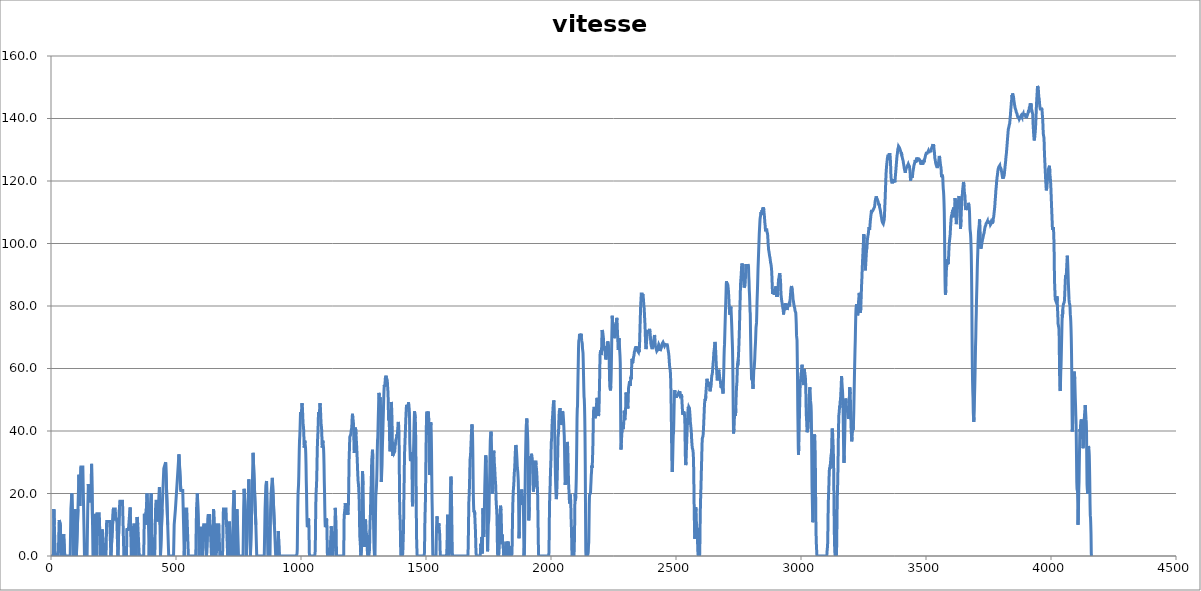
| Category | vitesse (km/h) |
|---|---|
| 0.0 | 0 |
| 9.4 | 0 |
| 11.4 | 15.012 |
| 13.3 | 10.008 |
| 17.1 | 0 |
| 29.2 | 0 |
| 32.7 | 11.484 |
| 34.1 | 11.484 |
| 37.6 | 10.008 |
| 40.8 | 0 |
| 48.9 | 0 |
| 50.6 | 6.984 |
| 51.3 | 6.984 |
| 55.0 | 0 |
| 76.9 | 0 |
| 79.6 | 15.012 |
| 79.8 | 15.012 |
| 80.0 | 15.012 |
| 80.9 | 15.012 |
| 83.3 | 20.016 |
| 87.1 | 10.008 |
| 90.5 | 0 |
| 90.9 | 0 |
| 95.5 | 15.012 |
| 98.2 | 15.012 |
| 99.3 | 10.008 |
| 101.5 | 0 |
| 105.1 | 0 |
| 107.9 | 15.012 |
| 108.4 | 15.012 |
| 108.9 | 15.012 |
| 111.6 | 25.992 |
| 112.4 | 25.992 |
| 115.2 | 15.984 |
| 119.8 | 28.512 |
| 127.4 | 28.512 |
| 131.7 | 10.008 |
| 133.9 | 0 |
| 144.4 | 0 |
| 146.8 | 14.508 |
| 147.2 | 14.508 |
| 147.7 | 14.508 |
| 149.4 | 23.004 |
| 149.9 | 23.004 |
| 151.5 | 17.496 |
| 159.3 | 17.496 |
| 162.3 | 29.484 |
| 163.3 | 29.484 |
| 166.3 | 10.008 |
| 167.9 | 0 |
| 175.5 | 0 |
| 178.3 | 13.5 |
| 180.9 | 13.5 |
| 181.3 | 10.008 |
| 182.6 | 0 |
| 184.3 | 13.5 |
| 193.1 | 13.5 |
| 194.3 | 10.008 |
| 197.7 | 0 |
| 202.4 | 0 |
| 204.3 | 8.496 |
| 206.5 | 7.488 |
| 211.1 | 0 |
| 220.1 | 0 |
| 222.6 | 11.016 |
| 234.7 | 11.016 |
| 239.7 | 0 |
| 242.2 | 0 |
| 249.5 | 15.012 |
| 256.9 | 15.012 |
| 259.0 | 11.736 |
| 263.3 | 11.736 |
| 263.7 | 10.008 |
| 267.7 | 0 |
| 270.5 | 0 |
| 273.6 | 15.012 |
| 274.1 | 15.012 |
| 274.6 | 15.012 |
| 275.4 | 17.496 |
| 286.0 | 17.496 |
| 288.4 | 10.008 |
| 291.5 | 0 |
| 302.0 | 0 |
| 303.5 | 8.496 |
| 309.7 | 8.496 |
| 316.5 | 15.516 |
| 318.4 | 10.008 |
| 321.3 | 0 |
| 328.4 | 0 |
| 331.4 | 10.008 |
| 335.9 | 10.008 |
| 340.3 | 0 |
| 341.3 | 0 |
| 344.6 | 12.492 |
| 345.6 | 12.492 |
| 347.1 | 10.008 |
| 353.1 | 0 |
| 370.8 | 0 |
| 373.5 | 13.5 |
| 374.5 | 13.5 |
| 376.8 | 10.008 |
| 379.9 | 10.008 |
| 381.4 | 15.012 |
| 381.9 | 15.012 |
| 382.4 | 15.012 |
| 383.9 | 20.016 |
| 387.2 | 20.016 |
| 390.0 | 10.008 |
| 392.7 | 0 |
| 393.3 | 0 |
| 396.7 | 15.012 |
| 397.2 | 15.012 |
| 397.7 | 15.012 |
| 400.8 | 20.016 |
| 402.6 | 10.008 |
| 404.9 | 0 |
| 415.1 | 0 |
| 418.2 | 15.012 |
| 418.7 | 15.012 |
| 419.2 | 15.012 |
| 420.0 | 17.496 |
| 425.5 | 17.496 |
| 429.0 | 11.016 |
| 433.8 | 21.996 |
| 436.1 | 10.008 |
| 437.9 | 0 |
| 441.0 | 0 |
| 444.6 | 15.012 |
| 445.1 | 15.012 |
| 445.6 | 15.012 |
| 451.2 | 28.008 |
| 458.6 | 29.988 |
| 466.8 | 10.008 |
| 470.8 | 0 |
| 490.2 | 0 |
| 492.7 | 10.008 |
| 496.1 | 10.008 |
| 497.7 | 15.012 |
| 498.2 | 15.012 |
| 498.7 | 15.012 |
| 511.7 | 32.508 |
| 512.7 | 32.508 |
| 519.2 | 20.988 |
| 527.0 | 20.988 |
| 530.3 | 10.008 |
| 533.0 | 0 |
| 534.4 | 0 |
| 537.8 | 15.012 |
| 543.0 | 15.012 |
| 545.2 | 10.008 |
| 549.5 | 0 |
| 579.1 | 0 |
| 582.1 | 15.012 |
| 582.6 | 15.012 |
| 583.1 | 15.012 |
| 585.4 | 20.016 |
| 586.6 | 20.016 |
| 589.6 | 10.008 |
| 592.4 | 0 |
| 595.1 | 0 |
| 596.7 | 9 |
| 603.5 | 9 |
| 606.4 | 0 |
| 609.1 | 0 |
| 611.0 | 10.008 |
| 618.7 | 10.008 |
| 622.1 | 0 |
| 625.7 | 0 |
| 628.9 | 12.996 |
| 634.7 | 12.996 |
| 636.4 | 10.008 |
| 642.0 | 0 |
| 647.8 | 0 |
| 650.3 | 15.012 |
| 651.5 | 15.012 |
| 652.8 | 10.008 |
| 655.5 | 0 |
| 661.3 | 0 |
| 663.5 | 10.008 |
| 671.5 | 10.008 |
| 675.1 | 0 |
| 686.2 | 0 |
| 689.7 | 15.012 |
| 700.0 | 15.012 |
| 702.2 | 10.008 |
| 706.6 | 0 |
| 712.1 | 0 |
| 713.5 | 11.016 |
| 714.5 | 11.016 |
| 718.4 | 0 |
| 726.5 | 0 |
| 728.7 | 15.012 |
| 729.1 | 15.012 |
| 729.6 | 15.012 |
| 732.0 | 20.988 |
| 732.8 | 20.988 |
| 735.8 | 10.008 |
| 738.5 | 0 |
| 740.7 | 0 |
| 743.3 | 15.012 |
| 744.3 | 15.012 |
| 746.2 | 10.008 |
| 750.0 | 0 |
| 768.3 | 0 |
| 770.6 | 15.012 |
| 771.1 | 15.012 |
| 771.6 | 15.012 |
| 772.5 | 21.492 |
| 776.2 | 21.492 |
| 779.1 | 10.008 |
| 781.4 | 0 |
| 784.7 | 0 |
| 787.2 | 15.012 |
| 788.2 | 15.012 |
| 791.3 | 24.516 |
| 793.3 | 24.516 |
| 795.7 | 10.008 |
| 797.7 | 0 |
| 798.9 | 0 |
| 802.8 | 15.012 |
| 803.3 | 15.012 |
| 803.8 | 15.012 |
| 808.4 | 33.012 |
| 812.3 | 33.012 |
| 819.4 | 10.008 |
| 822.9 | 0 |
| 853.1 | 0 |
| 856.3 | 15.012 |
| 856.8 | 15.012 |
| 857.3 | 15.012 |
| 859.4 | 22.5 |
| 862.2 | 24.012 |
| 865.2 | 10.008 |
| 867.5 | 0 |
| 876.0 | 0 |
| 878.3 | 15.012 |
| 878.8 | 15.012 |
| 879.3 | 15.012 |
| 880.3 | 20.016 |
| 885.3 | 24.984 |
| 893.5 | 10.008 |
| 898.8 | 0 |
| 907.4 | 0 |
| 909.3 | 7.992 |
| 910.0 | 7.992 |
| 913.1 | 0 |
| 933.1 | 0 |
| 964.1 | 0 |
| 965.1 | 0 |
| 966.1 | 0 |
| 967.1 | 0 |
| 968.1 | 0 |
| 969.1 | 0 |
| 970.1 | 0 |
| 971.1 | 0 |
| 972.1 | 0 |
| 973.1 | 0 |
| 974.1 | 0 |
| 975.1 | 0 |
| 976.1 | 0 |
| 977.1 | 0 |
| 978.1 | 0 |
| 979.1 | 0 |
| 980.1 | 0 |
| 981.1 | 0 |
| 982.1 | 0 |
| 983.1 | 0 |
| 984.1 | 0.7 |
| 985.1 | 2.1 |
| 986.1 | 9.2 |
| 987.1 | 15.6 |
| 988.1 | 19.8 |
| 989.1 | 19.8 |
| 990.1 | 22.7 |
| 991.1 | 25.5 |
| 992.1 | 29.8 |
| 993.1 | 34 |
| 994.1 | 36.9 |
| 995.1 | 38.3 |
| 996.1 | 40.4 |
| 997.1 | 43.2 |
| 998.1 | 46.1 |
| 999.1 | 46.1 |
| 1000.1 | 46.1 |
| 1001.1 | 44.6 |
| 1002.1 | 46.1 |
| 1003.1 | 48.2 |
| 1004.1 | 48.9 |
| 1005.1 | 48.2 |
| 1006.1 | 46.8 |
| 1007.1 | 44.6 |
| 1008.1 | 42.5 |
| 1009.1 | 41.8 |
| 1010.1 | 41.1 |
| 1011.1 | 39.7 |
| 1012.1 | 36.1 |
| 1013.1 | 34.7 |
| 1014.1 | 34.7 |
| 1015.1 | 36.9 |
| 1016.1 | 36.1 |
| 1017.1 | 36.1 |
| 1018.1 | 34.7 |
| 1019.1 | 32.6 |
| 1020.1 | 29.1 |
| 1021.1 | 24.1 |
| 1022.1 | 20.6 |
| 1023.1 | 15.6 |
| 1024.1 | 11.3 |
| 1025.1 | 9.2 |
| 1026.1 | 9.2 |
| 1027.1 | 9.2 |
| 1028.1 | 9.9 |
| 1029.1 | 10.6 |
| 1030.1 | 12 |
| 1031.1 | 11.3 |
| 1032.1 | 7.8 |
| 1033.1 | 1.4 |
| 1034.1 | 0 |
| 1035.1 | 0 |
| 1036.1 | 0 |
| 1037.1 | 0 |
| 1038.1 | 0 |
| 1039.1 | 0 |
| 1040.1 | 0 |
| 1041.1 | 0 |
| 1042.1 | 0 |
| 1043.1 | 0 |
| 1044.1 | 0 |
| 1045.1 | 0 |
| 1046.1 | 0 |
| 1047.1 | 0 |
| 1048.1 | 0 |
| 1049.1 | 0 |
| 1050.1 | 0 |
| 1051.1 | 0 |
| 1052.1 | 0 |
| 1053.1 | 0 |
| 1054.1 | 0 |
| 1055.1 | 0 |
| 1056.1 | 0.7 |
| 1057.1 | 2.1 |
| 1058.1 | 9.2 |
| 1059.1 | 15.6 |
| 1060.1 | 19.8 |
| 1061.1 | 19.8 |
| 1062.1 | 22.7 |
| 1063.1 | 25.5 |
| 1064.1 | 29.8 |
| 1065.1 | 34 |
| 1066.1 | 36.9 |
| 1067.1 | 38.3 |
| 1068.1 | 40.4 |
| 1069.1 | 43.2 |
| 1070.1 | 46.1 |
| 1071.1 | 46.1 |
| 1072.1 | 46.1 |
| 1073.1 | 44.6 |
| 1074.1 | 46.1 |
| 1075.1 | 48.2 |
| 1076.1 | 48.9 |
| 1077.1 | 48.2 |
| 1078.1 | 46.8 |
| 1079.1 | 44.6 |
| 1080.1 | 42.5 |
| 1081.1 | 41.8 |
| 1082.1 | 41.1 |
| 1083.1 | 39.7 |
| 1084.1 | 36.1 |
| 1085.1 | 34.7 |
| 1086.1 | 34.7 |
| 1087.1 | 36.9 |
| 1088.1 | 36.1 |
| 1089.1 | 36.1 |
| 1090.1 | 34.7 |
| 1091.1 | 32.6 |
| 1092.1 | 29.1 |
| 1093.1 | 24.1 |
| 1094.1 | 20.6 |
| 1095.1 | 15.6 |
| 1096.1 | 11.3 |
| 1097.1 | 9.2 |
| 1098.1 | 9.2 |
| 1099.1 | 9.2 |
| 1100.1 | 9.9 |
| 1101.1 | 10.6 |
| 1102.1 | 12 |
| 1103.1 | 11.3 |
| 1104.1 | 7.8 |
| 1105.1 | 1.4 |
| 1106.1 | 0 |
| 1107.1 | 0 |
| 1108.1 | 0 |
| 1109.1 | 0 |
| 1110.1 | 0 |
| 1111.1 | 0 |
| 1112.1 | 0 |
| 1113.1 | 0 |
| 1114.1 | 0 |
| 1115.1 | 0 |
| 1116.1 | 0.7 |
| 1117.1 | 1.5 |
| 1118.1 | 4.4 |
| 1119.1 | 5.9 |
| 1120.1 | 7.3 |
| 1121.1 | 9.5 |
| 1122.1 | 8.1 |
| 1123.1 | 3.7 |
| 1124.1 | 2.9 |
| 1125.1 | 4.4 |
| 1126.1 | 0.7 |
| 1127.1 | 0 |
| 1128.1 | 0 |
| 1129.1 | 2.2 |
| 1130.1 | 2.2 |
| 1131.1 | 2.9 |
| 1132.1 | 7.3 |
| 1133.1 | 5.9 |
| 1134.1 | 7.3 |
| 1135.1 | 8.8 |
| 1136.1 | 11 |
| 1137.1 | 15.4 |
| 1138.1 | 13.9 |
| 1139.1 | 11.7 |
| 1140.1 | 11 |
| 1141.1 | 5.1 |
| 1142.1 | 0 |
| 1143.1 | 0 |
| 1144.1 | 0 |
| 1145.1 | 0 |
| 1146.1 | 0 |
| 1147.1 | 0 |
| 1148.1 | 0 |
| 1149.1 | 0 |
| 1150.1 | 0 |
| 1151.1 | 0 |
| 1152.1 | 0 |
| 1153.1 | 0 |
| 1154.1 | 0 |
| 1155.1 | 0 |
| 1156.1 | 0 |
| 1157.1 | 0 |
| 1158.1 | 0 |
| 1159.1 | 0 |
| 1160.1 | 0 |
| 1161.1 | 0 |
| 1162.1 | 0 |
| 1163.1 | 0 |
| 1164.1 | 0 |
| 1165.1 | 0 |
| 1166.1 | 0 |
| 1167.1 | 0 |
| 1168.1 | 0 |
| 1169.1 | 0 |
| 1170.1 | 0 |
| 1171.1 | 0.7 |
| 1172.1 | 11 |
| 1173.1 | 13.2 |
| 1174.1 | 13.9 |
| 1175.1 | 14.7 |
| 1176.1 | 15.4 |
| 1177.1 | 16.9 |
| 1178.1 | 16.1 |
| 1179.1 | 15.4 |
| 1180.1 | 13.9 |
| 1181.1 | 13.2 |
| 1182.1 | 13.2 |
| 1183.1 | 15.4 |
| 1184.1 | 16.9 |
| 1185.1 | 16.1 |
| 1186.1 | 14.7 |
| 1187.1 | 13.2 |
| 1188.1 | 13.9 |
| 1189.1 | 14.7 |
| 1190.1 | 18.3 |
| 1191.1 | 22 |
| 1192.1 | 30.1 |
| 1193.1 | 32.3 |
| 1194.1 | 32.3 |
| 1195.1 | 38.1 |
| 1196.1 | 38.1 |
| 1197.1 | 38.1 |
| 1198.1 | 38.1 |
| 1199.1 | 38.9 |
| 1200.1 | 39.6 |
| 1201.1 | 40.3 |
| 1202.1 | 40.3 |
| 1203.1 | 41.1 |
| 1204.1 | 43.3 |
| 1205.1 | 44.7 |
| 1206.1 | 45.5 |
| 1207.1 | 44 |
| 1208.1 | 44 |
| 1209.1 | 43.3 |
| 1210.1 | 41.8 |
| 1211.1 | 38.9 |
| 1212.1 | 34.5 |
| 1213.1 | 33 |
| 1214.1 | 33.7 |
| 1215.1 | 36.7 |
| 1216.1 | 37.4 |
| 1217.1 | 40.3 |
| 1218.1 | 41.1 |
| 1219.1 | 41.1 |
| 1220.1 | 38.9 |
| 1221.1 | 37.4 |
| 1222.1 | 35.9 |
| 1223.1 | 34.5 |
| 1224.1 | 32.3 |
| 1225.1 | 30.8 |
| 1226.1 | 27.9 |
| 1227.1 | 26.4 |
| 1228.1 | 24.2 |
| 1229.1 | 23.5 |
| 1230.1 | 22.7 |
| 1231.1 | 21.3 |
| 1232.1 | 19.1 |
| 1233.1 | 16.9 |
| 1234.1 | 11 |
| 1235.1 | 6.6 |
| 1236.1 | 5.1 |
| 1237.1 | 4.4 |
| 1238.1 | 2.2 |
| 1239.1 | 0 |
| 1240.1 | 0 |
| 1241.1 | 0 |
| 1242.1 | 2.2 |
| 1243.1 | 5.1 |
| 1244.1 | 13.9 |
| 1245.1 | 22.7 |
| 1246.1 | 27.1 |
| 1247.1 | 27.1 |
| 1248.1 | 22.7 |
| 1249.1 | 18.3 |
| 1250.1 | 11.7 |
| 1251.1 | 8.8 |
| 1252.1 | 6.6 |
| 1253.1 | 3.7 |
| 1254.1 | 2.9 |
| 1255.1 | 4.4 |
| 1256.1 | 11 |
| 1257.1 | 11.7 |
| 1258.1 | 11.7 |
| 1259.1 | 11 |
| 1260.1 | 8.8 |
| 1261.1 | 6.6 |
| 1262.1 | 7.3 |
| 1263.1 | 5.9 |
| 1264.1 | 4.4 |
| 1265.1 | 2.2 |
| 1266.1 | 0.7 |
| 1267.1 | 0 |
| 1268.1 | 0 |
| 1269.1 | 0 |
| 1270.1 | 0 |
| 1271.1 | 0 |
| 1272.1 | 0 |
| 1273.1 | 0 |
| 1274.1 | 2 |
| 1275.1 | 6.9 |
| 1276.1 | 10.8 |
| 1277.1 | 12.3 |
| 1278.1 | 14.3 |
| 1279.1 | 19.7 |
| 1280.1 | 21.2 |
| 1281.1 | 23.7 |
| 1282.1 | 28.1 |
| 1283.1 | 31 |
| 1284.1 | 31.5 |
| 1285.1 | 33 |
| 1286.1 | 34 |
| 1287.1 | 31 |
| 1288.1 | 24.1 |
| 1289.1 | 15.8 |
| 1290.1 | 10.8 |
| 1291.1 | 6.4 |
| 1292.1 | 2.5 |
| 1293.1 | 1.5 |
| 1294.1 | 0 |
| 1295.1 | 0 |
| 1296.1 | 0.5 |
| 1297.1 | 6.4 |
| 1298.1 | 13.8 |
| 1299.1 | 19.2 |
| 1300.1 | 19.2 |
| 1301.1 | 21.2 |
| 1302.1 | 22.7 |
| 1303.1 | 25.1 |
| 1304.1 | 28.6 |
| 1305.1 | 33.5 |
| 1306.1 | 37 |
| 1307.1 | 37.9 |
| 1308.1 | 40.9 |
| 1309.1 | 44.4 |
| 1310.1 | 47.3 |
| 1311.1 | 50.8 |
| 1312.1 | 52.2 |
| 1313.1 | 51.3 |
| 1314.1 | 48.8 |
| 1315.1 | 48.8 |
| 1316.1 | 50.8 |
| 1317.1 | 50.8 |
| 1318.1 | 47.3 |
| 1319.1 | 40.4 |
| 1320.1 | 29.1 |
| 1321.1 | 23.7 |
| 1322.1 | 25.1 |
| 1323.1 | 27.1 |
| 1324.1 | 29.1 |
| 1325.1 | 33.5 |
| 1326.1 | 36.5 |
| 1327.1 | 38.9 |
| 1328.1 | 41.9 |
| 1329.1 | 44.8 |
| 1330.1 | 47.8 |
| 1331.1 | 50.8 |
| 1332.1 | 53.2 |
| 1333.1 | 54.7 |
| 1334.1 | 54.2 |
| 1335.1 | 54.7 |
| 1336.1 | 55.2 |
| 1337.1 | 56.7 |
| 1338.1 | 57.2 |
| 1339.1 | 57.2 |
| 1340.1 | 57.7 |
| 1341.1 | 57.2 |
| 1342.1 | 57.2 |
| 1343.1 | 56.7 |
| 1344.1 | 56.7 |
| 1345.1 | 56.2 |
| 1346.1 | 54.7 |
| 1347.1 | 54.7 |
| 1348.1 | 52.2 |
| 1349.1 | 48.8 |
| 1350.1 | 43.9 |
| 1351.1 | 43.4 |
| 1352.1 | 44.4 |
| 1353.1 | 43.4 |
| 1354.1 | 38.4 |
| 1355.1 | 34.5 |
| 1356.1 | 33.5 |
| 1357.1 | 34 |
| 1358.1 | 37.5 |
| 1359.1 | 41.9 |
| 1360.1 | 45.8 |
| 1361.1 | 49.3 |
| 1362.1 | 48.3 |
| 1363.1 | 46.3 |
| 1364.1 | 43.4 |
| 1365.1 | 38.9 |
| 1366.1 | 33.5 |
| 1367.1 | 32 |
| 1368.1 | 33 |
| 1369.1 | 34 |
| 1370.1 | 34 |
| 1371.1 | 33.5 |
| 1372.1 | 33 |
| 1373.1 | 33 |
| 1374.1 | 33 |
| 1375.1 | 33.5 |
| 1376.1 | 35 |
| 1377.1 | 35.5 |
| 1378.1 | 36 |
| 1379.1 | 37 |
| 1380.1 | 37 |
| 1381.1 | 37.5 |
| 1382.1 | 37.5 |
| 1383.1 | 38.4 |
| 1384.1 | 38.9 |
| 1385.1 | 38.4 |
| 1386.1 | 38.4 |
| 1387.1 | 40.4 |
| 1388.1 | 42.4 |
| 1389.1 | 42.9 |
| 1390.1 | 42.4 |
| 1391.1 | 41.4 |
| 1392.1 | 38.9 |
| 1393.1 | 30.6 |
| 1394.1 | 19.7 |
| 1395.1 | 13.8 |
| 1396.1 | 12.3 |
| 1397.1 | 10.8 |
| 1398.1 | 4.4 |
| 1399.1 | 0.5 |
| 1400.1 | 0 |
| 1401.1 | 0 |
| 1402.1 | 0 |
| 1403.1 | 0 |
| 1404.1 | 0 |
| 1405.1 | 0 |
| 1406.1 | 0 |
| 1407.1 | 0.7 |
| 1408.1 | 3.6 |
| 1409.1 | 5.8 |
| 1410.1 | 8.7 |
| 1411.1 | 15.9 |
| 1412.1 | 21 |
| 1413.1 | 26.7 |
| 1414.1 | 32.5 |
| 1415.1 | 34.7 |
| 1416.1 | 36.9 |
| 1417.1 | 39 |
| 1418.1 | 41.2 |
| 1419.1 | 43.4 |
| 1420.1 | 45.5 |
| 1421.1 | 47 |
| 1422.1 | 48.4 |
| 1423.1 | 48.4 |
| 1424.1 | 48.4 |
| 1425.1 | 47.7 |
| 1426.1 | 47.7 |
| 1427.1 | 47 |
| 1428.1 | 47.7 |
| 1429.1 | 48.4 |
| 1430.1 | 49.2 |
| 1431.1 | 49.2 |
| 1432.1 | 49.2 |
| 1433.1 | 49.2 |
| 1434.1 | 44.1 |
| 1435.1 | 36.1 |
| 1436.1 | 34 |
| 1437.1 | 31.1 |
| 1438.1 | 30.4 |
| 1439.1 | 31.8 |
| 1440.1 | 32.5 |
| 1441.1 | 33.3 |
| 1442.1 | 31.8 |
| 1443.1 | 31.1 |
| 1444.1 | 28.9 |
| 1445.1 | 18.1 |
| 1446.1 | 15.9 |
| 1447.1 | 18.1 |
| 1448.1 | 23.1 |
| 1449.1 | 27.5 |
| 1450.1 | 33.3 |
| 1451.1 | 36.9 |
| 1452.1 | 41.2 |
| 1453.1 | 44.1 |
| 1454.1 | 46.3 |
| 1455.1 | 46.3 |
| 1456.1 | 46.3 |
| 1457.1 | 44.1 |
| 1458.1 | 41.2 |
| 1459.1 | 35.4 |
| 1460.1 | 26.7 |
| 1461.1 | 15.9 |
| 1462.1 | 6.5 |
| 1463.1 | 3.6 |
| 1464.1 | 0.7 |
| 1465.1 | 0 |
| 1466.1 | 0 |
| 1467.1 | 0 |
| 1468.1 | 0 |
| 1469.1 | 0 |
| 1470.1 | 0 |
| 1471.1 | 0 |
| 1472.1 | 0 |
| 1473.1 | 0 |
| 1474.1 | 0 |
| 1475.1 | 0 |
| 1476.1 | 0 |
| 1477.1 | 0 |
| 1478.1 | 0 |
| 1479.1 | 0 |
| 1480.1 | 0 |
| 1481.1 | 0 |
| 1482.1 | 0 |
| 1483.1 | 0 |
| 1484.1 | 0 |
| 1485.1 | 0 |
| 1486.1 | 0 |
| 1487.1 | 0 |
| 1488.1 | 0 |
| 1489.1 | 0 |
| 1490.1 | 0 |
| 1491.1 | 0 |
| 1492.1 | 0 |
| 1493.1 | 0 |
| 1494.1 | 2 |
| 1495.1 | 8.5 |
| 1496.1 | 13.4 |
| 1497.1 | 14.9 |
| 1498.1 | 20.4 |
| 1499.1 | 27.3 |
| 1500.1 | 33.8 |
| 1501.1 | 39.8 |
| 1502.1 | 44.7 |
| 1503.1 | 45.2 |
| 1504.1 | 46.2 |
| 1505.1 | 42.3 |
| 1506.1 | 38.8 |
| 1507.1 | 39.3 |
| 1508.1 | 43.3 |
| 1509.1 | 46.2 |
| 1510.1 | 46.2 |
| 1511.1 | 43.3 |
| 1512.1 | 38.3 |
| 1513.1 | 29.3 |
| 1514.1 | 25.9 |
| 1515.1 | 26.4 |
| 1516.1 | 31.3 |
| 1517.1 | 36.8 |
| 1518.1 | 41.3 |
| 1519.1 | 42.8 |
| 1520.1 | 41.8 |
| 1521.1 | 38.8 |
| 1522.1 | 33.3 |
| 1523.1 | 25.4 |
| 1524.1 | 18.4 |
| 1525.1 | 14.4 |
| 1526.1 | 6.5 |
| 1527.1 | 0.5 |
| 1528.1 | 0 |
| 1529.1 | 0 |
| 1530.1 | 0 |
| 1531.1 | 0 |
| 1532.1 | 0 |
| 1533.1 | 0 |
| 1534.1 | 0 |
| 1535.1 | 0 |
| 1536.1 | 0 |
| 1537.1 | 0 |
| 1538.1 | 0 |
| 1539.1 | 0 |
| 1540.1 | 0 |
| 1541.1 | 5.3 |
| 1542.1 | 9.2 |
| 1543.1 | 11 |
| 1544.1 | 12.7 |
| 1545.1 | 11.8 |
| 1546.1 | 8.8 |
| 1547.1 | 7.5 |
| 1548.1 | 7.9 |
| 1549.1 | 8.3 |
| 1550.1 | 9.2 |
| 1551.1 | 10.5 |
| 1552.1 | 9.6 |
| 1553.1 | 8.8 |
| 1554.1 | 8.8 |
| 1555.1 | 6.6 |
| 1556.1 | 2.6 |
| 1557.1 | 0.4 |
| 1558.1 | 0 |
| 1559.1 | 0 |
| 1560.1 | 0 |
| 1561.1 | 0 |
| 1562.1 | 0 |
| 1563.1 | 0 |
| 1564.1 | 0 |
| 1565.1 | 0 |
| 1566.1 | 0 |
| 1567.1 | 0 |
| 1568.1 | 0 |
| 1569.1 | 0 |
| 1570.1 | 0 |
| 1571.1 | 0 |
| 1572.1 | 0 |
| 1573.1 | 0 |
| 1574.1 | 0 |
| 1575.1 | 0 |
| 1576.1 | 0 |
| 1577.1 | 0 |
| 1578.1 | 0 |
| 1579.1 | 0 |
| 1580.1 | 0 |
| 1581.1 | 0 |
| 1582.1 | 0 |
| 1583.1 | 0 |
| 1584.1 | 3.1 |
| 1585.1 | 7.9 |
| 1586.1 | 13.2 |
| 1587.1 | 13.2 |
| 1588.1 | 7.5 |
| 1589.1 | 3.5 |
| 1590.1 | 1.3 |
| 1591.1 | 0 |
| 1592.1 | 0 |
| 1593.1 | 0 |
| 1594.1 | 0 |
| 1595.1 | 1.8 |
| 1596.1 | 9.6 |
| 1597.1 | 17.1 |
| 1598.1 | 21.5 |
| 1599.1 | 24.1 |
| 1600.1 | 25.4 |
| 1601.1 | 22.8 |
| 1602.1 | 18.4 |
| 1603.1 | 12.3 |
| 1604.1 | 6.6 |
| 1605.1 | 1.3 |
| 1606.1 | 0 |
| 1607.1 | 0 |
| 1608.1 | 0 |
| 1609.1 | 0 |
| 1610.1 | 0 |
| 1611.1 | 0 |
| 1612.1 | 0 |
| 1613.1 | 0 |
| 1614.1 | 0 |
| 1615.1 | 0 |
| 1616.1 | 0 |
| 1617.1 | 0 |
| 1618.1 | 0 |
| 1619.1 | 0 |
| 1620.1 | 0 |
| 1621.1 | 0 |
| 1622.1 | 0 |
| 1623.1 | 0 |
| 1624.1 | 0 |
| 1625.1 | 0 |
| 1626.1 | 0 |
| 1627.1 | 0 |
| 1628.1 | 0 |
| 1629.1 | 0 |
| 1630.1 | 0 |
| 1631.1 | 0 |
| 1632.1 | 0 |
| 1633.1 | 0 |
| 1634.1 | 0 |
| 1635.1 | 0 |
| 1636.1 | 0 |
| 1637.1 | 0 |
| 1638.1 | 0 |
| 1639.1 | 0 |
| 1640.1 | 0 |
| 1641.1 | 0 |
| 1642.1 | 0 |
| 1643.1 | 0 |
| 1644.1 | 0 |
| 1645.1 | 0 |
| 1646.1 | 0 |
| 1647.1 | 0 |
| 1648.1 | 0 |
| 1649.1 | 0 |
| 1650.1 | 0 |
| 1651.1 | 0 |
| 1652.1 | 0 |
| 1653.1 | 0 |
| 1654.1 | 0 |
| 1655.1 | 0 |
| 1656.1 | 0 |
| 1657.1 | 0 |
| 1658.1 | 0 |
| 1659.1 | 0 |
| 1660.1 | 0 |
| 1661.1 | 0 |
| 1662.1 | 0 |
| 1663.1 | 0 |
| 1664.1 | 0 |
| 1665.1 | 0 |
| 1666.1 | 0 |
| 1667.1 | 0 |
| 1668.1 | 0.4 |
| 1669.1 | 4.4 |
| 1670.1 | 9.6 |
| 1671.1 | 16.7 |
| 1672.1 | 18.4 |
| 1673.1 | 20.2 |
| 1674.1 | 23.2 |
| 1675.1 | 26.7 |
| 1676.1 | 30.7 |
| 1677.1 | 31.6 |
| 1678.1 | 32 |
| 1679.1 | 34.2 |
| 1680.1 | 36 |
| 1681.1 | 38.1 |
| 1682.1 | 39.9 |
| 1683.1 | 41.7 |
| 1684.1 | 42.1 |
| 1685.1 | 40.8 |
| 1686.1 | 39 |
| 1687.1 | 34.2 |
| 1688.1 | 27.6 |
| 1689.1 | 20.6 |
| 1690.1 | 16.7 |
| 1691.1 | 14.5 |
| 1692.1 | 14 |
| 1693.1 | 14 |
| 1694.1 | 14.5 |
| 1695.1 | 13.2 |
| 1696.1 | 11 |
| 1697.1 | 9.2 |
| 1698.1 | 7.5 |
| 1699.1 | 3.5 |
| 1700.1 | 1.3 |
| 1701.1 | 0 |
| 1702.1 | 0 |
| 1703.1 | 0 |
| 1704.1 | 0 |
| 1705.1 | 0 |
| 1706.1 | 0 |
| 1707.1 | 0 |
| 1708.1 | 0 |
| 1709.1 | 0 |
| 1710.1 | 0 |
| 1711.1 | 0 |
| 1712.1 | 0 |
| 1713.1 | 0 |
| 1714.1 | 0 |
| 1715.1 | 0 |
| 1716.1 | 0 |
| 1717.1 | 0 |
| 1718.1 | 0 |
| 1719.1 | 3.8 |
| 1720.1 | 3.1 |
| 1721.1 | 3.1 |
| 1722.1 | 4.6 |
| 1723.1 | 6.1 |
| 1724.1 | 4.6 |
| 1725.1 | 0.8 |
| 1726.1 | 3.8 |
| 1727.1 | 11.5 |
| 1728.1 | 15.3 |
| 1729.1 | 10.7 |
| 1730.1 | 6.9 |
| 1731.1 | 6.1 |
| 1732.1 | 8.4 |
| 1733.1 | 13 |
| 1734.1 | 17.6 |
| 1735.1 | 22.2 |
| 1736.1 | 25.3 |
| 1737.1 | 28.3 |
| 1738.1 | 31.4 |
| 1739.1 | 32.2 |
| 1740.1 | 32.2 |
| 1741.1 | 29.9 |
| 1742.1 | 24.5 |
| 1743.1 | 19.1 |
| 1744.1 | 14.6 |
| 1745.1 | 7.7 |
| 1746.1 | 1.5 |
| 1747.1 | 2.3 |
| 1748.1 | 6.1 |
| 1749.1 | 10 |
| 1750.1 | 10 |
| 1751.1 | 11.5 |
| 1752.1 | 13.8 |
| 1753.1 | 19.9 |
| 1754.1 | 23 |
| 1755.1 | 26.8 |
| 1756.1 | 32.9 |
| 1757.1 | 36.8 |
| 1758.1 | 38.3 |
| 1759.1 | 38.3 |
| 1760.1 | 39.8 |
| 1761.1 | 38.3 |
| 1762.1 | 34.5 |
| 1763.1 | 30.6 |
| 1764.1 | 24.5 |
| 1765.1 | 19.9 |
| 1766.1 | 19.9 |
| 1767.1 | 22.2 |
| 1768.1 | 25.3 |
| 1769.1 | 29.9 |
| 1770.1 | 32.9 |
| 1771.1 | 33.7 |
| 1772.1 | 32.9 |
| 1773.1 | 29.9 |
| 1774.1 | 29.1 |
| 1775.1 | 27.6 |
| 1776.1 | 26 |
| 1777.1 | 24.5 |
| 1778.1 | 24.5 |
| 1779.1 | 22.2 |
| 1780.1 | 18.4 |
| 1781.1 | 16.9 |
| 1782.1 | 15.3 |
| 1783.1 | 14.6 |
| 1784.1 | 11.5 |
| 1785.1 | 6.9 |
| 1786.1 | 0.8 |
| 1787.1 | 0 |
| 1788.1 | 0 |
| 1789.1 | 0 |
| 1790.1 | 0 |
| 1791.1 | 0 |
| 1792.1 | 0 |
| 1793.1 | 0 |
| 1794.1 | 4.6 |
| 1795.1 | 10.7 |
| 1796.1 | 13 |
| 1797.1 | 14.6 |
| 1798.1 | 16.1 |
| 1799.1 | 16.1 |
| 1800.1 | 14.6 |
| 1801.1 | 12.3 |
| 1802.1 | 7.7 |
| 1803.1 | 5.4 |
| 1804.1 | 6.1 |
| 1805.1 | 6.9 |
| 1806.1 | 3.8 |
| 1807.1 | 3.8 |
| 1808.1 | 4.6 |
| 1809.1 | 4.6 |
| 1810.1 | 1.5 |
| 1811.1 | 0 |
| 1812.1 | 1.5 |
| 1813.1 | 2.3 |
| 1814.1 | 3.1 |
| 1815.1 | 2.3 |
| 1816.1 | 1.5 |
| 1817.1 | 0 |
| 1818.1 | 0 |
| 1819.1 | 0.8 |
| 1820.1 | 2.3 |
| 1821.1 | 3.1 |
| 1822.1 | 3.8 |
| 1823.1 | 4.6 |
| 1824.1 | 3.1 |
| 1825.1 | 0 |
| 1826.1 | 0.8 |
| 1827.1 | 3.1 |
| 1828.1 | 4.6 |
| 1829.1 | 4.6 |
| 1830.1 | 3.8 |
| 1831.1 | 3.1 |
| 1832.1 | 0.8 |
| 1833.1 | 0 |
| 1834.1 | 3.1 |
| 1835.1 | 2.3 |
| 1836.1 | 0 |
| 1837.1 | 0 |
| 1838.1 | 0 |
| 1839.1 | 0 |
| 1840.1 | 0 |
| 1841.1 | 0 |
| 1842.1 | 0 |
| 1843.1 | 0 |
| 1844.1 | 0.7 |
| 1845.1 | 6.4 |
| 1846.1 | 12.1 |
| 1847.1 | 16.3 |
| 1848.1 | 18.5 |
| 1849.1 | 20.6 |
| 1850.1 | 22 |
| 1851.1 | 22.7 |
| 1852.1 | 24.9 |
| 1853.1 | 26.3 |
| 1854.1 | 27.7 |
| 1855.1 | 28.4 |
| 1856.1 | 31.2 |
| 1857.1 | 32.7 |
| 1858.1 | 34.8 |
| 1859.1 | 35.5 |
| 1860.1 | 35.5 |
| 1861.1 | 34.8 |
| 1862.1 | 33.4 |
| 1863.1 | 32 |
| 1864.1 | 30.5 |
| 1865.1 | 28.4 |
| 1866.1 | 27.7 |
| 1867.1 | 27 |
| 1868.1 | 25.6 |
| 1869.1 | 24.1 |
| 1870.1 | 19.9 |
| 1871.1 | 12.8 |
| 1872.1 | 5.7 |
| 1873.1 | 7.8 |
| 1874.1 | 12.8 |
| 1875.1 | 17.8 |
| 1876.1 | 19.9 |
| 1877.1 | 18.5 |
| 1878.1 | 17 |
| 1879.1 | 16.3 |
| 1880.1 | 17.8 |
| 1881.1 | 19.2 |
| 1882.1 | 19.9 |
| 1883.1 | 21.3 |
| 1884.1 | 18.5 |
| 1885.1 | 17.8 |
| 1886.1 | 16.3 |
| 1887.1 | 18.5 |
| 1888.1 | 19.2 |
| 1889.1 | 17.8 |
| 1890.1 | 12.8 |
| 1891.1 | 5.7 |
| 1892.1 | 0 |
| 1893.1 | 0 |
| 1894.1 | 3.6 |
| 1895.1 | 10.7 |
| 1896.1 | 19.2 |
| 1897.1 | 26.3 |
| 1898.1 | 31.2 |
| 1899.1 | 35.5 |
| 1900.1 | 39.1 |
| 1901.1 | 41.9 |
| 1902.1 | 42.6 |
| 1903.1 | 44 |
| 1904.1 | 42.6 |
| 1905.1 | 41.2 |
| 1906.1 | 39.1 |
| 1907.1 | 36.9 |
| 1908.1 | 31.2 |
| 1909.1 | 27 |
| 1910.1 | 18.5 |
| 1911.1 | 11.4 |
| 1912.1 | 11.4 |
| 1913.1 | 15.6 |
| 1914.1 | 22 |
| 1915.1 | 24.9 |
| 1916.1 | 27 |
| 1917.1 | 29.1 |
| 1918.1 | 30.5 |
| 1919.1 | 32 |
| 1920.1 | 32 |
| 1921.1 | 31.2 |
| 1922.1 | 32.7 |
| 1923.1 | 32 |
| 1924.1 | 32 |
| 1925.1 | 31.2 |
| 1926.1 | 29.8 |
| 1927.1 | 28.4 |
| 1928.1 | 23.4 |
| 1929.1 | 21.3 |
| 1930.1 | 20.6 |
| 1931.1 | 22.7 |
| 1932.1 | 22 |
| 1933.1 | 22 |
| 1934.1 | 23.4 |
| 1935.1 | 26.3 |
| 1936.1 | 28.4 |
| 1937.1 | 29.8 |
| 1938.1 | 29.8 |
| 1939.1 | 30.5 |
| 1940.1 | 29.1 |
| 1941.1 | 29.1 |
| 1942.1 | 27.7 |
| 1943.1 | 26.3 |
| 1944.1 | 24.9 |
| 1945.1 | 22.7 |
| 1946.1 | 21.3 |
| 1947.1 | 17 |
| 1948.1 | 11.4 |
| 1949.1 | 5.7 |
| 1950.1 | 0.7 |
| 1951.1 | 0 |
| 1952.1 | 0 |
| 1953.1 | 0 |
| 1954.1 | 0 |
| 1955.1 | 0 |
| 1956.1 | 0 |
| 1987.1 | 0 |
| 1988.1 | 0 |
| 1989.1 | 0 |
| 1990.1 | 0 |
| 1991.1 | 0 |
| 1992.1 | 2.016 |
| 1993.1 | 9.396 |
| 1994.1 | 16.308 |
| 1995.1 | 19.692 |
| 1996.1 | 21.204 |
| 1997.1 | 24.084 |
| 1998.1 | 27.612 |
| 1999.1 | 29.088 |
| 2000.1 | 32.508 |
| 2001.1 | 36.504 |
| 2002.1 | 37.008 |
| 2003.1 | 38.412 |
| 2004.1 | 41.4 |
| 2005.1 | 43.416 |
| 2006.1 | 44.388 |
| 2007.1 | 45.792 |
| 2008.1 | 47.304 |
| 2009.1 | 48.312 |
| 2010.1 | 49.284 |
| 2011.1 | 49.788 |
| 2012.1 | 49.284 |
| 2013.1 | 46.296 |
| 2014.1 | 42.408 |
| 2015.1 | 38.412 |
| 2016.1 | 34.488 |
| 2017.1 | 28.584 |
| 2018.1 | 24.588 |
| 2019.1 | 21.708 |
| 2020.1 | 19.692 |
| 2021.1 | 18.216 |
| 2022.1 | 18.684 |
| 2023.1 | 20.196 |
| 2024.1 | 23.184 |
| 2025.1 | 25.596 |
| 2026.1 | 30.096 |
| 2027.1 | 33.516 |
| 2028.1 | 37.908 |
| 2029.1 | 37.908 |
| 2030.1 | 39.384 |
| 2031.1 | 42.408 |
| 2032.1 | 44.784 |
| 2033.1 | 46.296 |
| 2034.1 | 46.296 |
| 2035.1 | 46.8 |
| 2036.1 | 47.304 |
| 2037.1 | 46.8 |
| 2038.1 | 45.792 |
| 2039.1 | 43.884 |
| 2040.1 | 41.904 |
| 2041.1 | 41.904 |
| 2042.1 | 41.904 |
| 2043.1 | 43.884 |
| 2044.1 | 45.288 |
| 2045.1 | 45.792 |
| 2046.1 | 46.296 |
| 2047.1 | 46.296 |
| 2048.1 | 45.792 |
| 2049.1 | 44.784 |
| 2050.1 | 43.416 |
| 2051.1 | 41.904 |
| 2052.1 | 39.888 |
| 2053.1 | 38.412 |
| 2054.1 | 34.488 |
| 2055.1 | 29.088 |
| 2056.1 | 25.092 |
| 2057.1 | 22.716 |
| 2058.1 | 24.588 |
| 2059.1 | 27.108 |
| 2060.1 | 30.096 |
| 2061.1 | 32.004 |
| 2062.1 | 33.984 |
| 2063.1 | 33.516 |
| 2064.1 | 34.992 |
| 2065.1 | 36.504 |
| 2066.1 | 36 |
| 2067.1 | 33.984 |
| 2068.1 | 31.5 |
| 2069.1 | 27.108 |
| 2070.1 | 23.688 |
| 2071.1 | 21.708 |
| 2072.1 | 20.7 |
| 2073.1 | 18.684 |
| 2074.1 | 16.812 |
| 2075.1 | 17.712 |
| 2076.1 | 18.684 |
| 2077.1 | 19.692 |
| 2078.1 | 18.684 |
| 2079.1 | 17.208 |
| 2080.1 | 12.816 |
| 2081.1 | 10.296 |
| 2082.1 | 7.884 |
| 2083.1 | 2.988 |
| 2084.1 | 0 |
| 2085.1 | 0 |
| 2086.1 | 0 |
| 2087.1 | 0 |
| 2088.1 | 0 |
| 2089.1 | 0 |
| 2090.1 | 0 |
| 2091.1 | 0 |
| 2092.1 | 0 |
| 2093.1 | 0 |
| 2094.1 | 6.192 |
| 2095.1 | 14.688 |
| 2096.1 | 19.296 |
| 2097.1 | 20.088 |
| 2098.1 | 17.784 |
| 2099.1 | 19.296 |
| 2100.1 | 21.6 |
| 2101.1 | 24.696 |
| 2102.1 | 30.096 |
| 2103.1 | 36.288 |
| 2104.1 | 43.992 |
| 2105.1 | 47.088 |
| 2106.1 | 47.916 |
| 2107.1 | 53.316 |
| 2108.1 | 57.888 |
| 2109.1 | 61.812 |
| 2110.1 | 66.384 |
| 2111.1 | 68.796 |
| 2112.1 | 68.796 |
| 2113.1 | 69.516 |
| 2114.1 | 71.1 |
| 2115.1 | 71.1 |
| 2116.1 | 70.308 |
| 2117.1 | 70.308 |
| 2118.1 | 70.308 |
| 2119.1 | 69.516 |
| 2120.1 | 71.1 |
| 2121.1 | 70.308 |
| 2122.1 | 70.308 |
| 2123.1 | 68.796 |
| 2124.1 | 68.796 |
| 2125.1 | 68.004 |
| 2126.1 | 66.384 |
| 2127.1 | 66.384 |
| 2128.1 | 64.908 |
| 2129.1 | 61.812 |
| 2130.1 | 57.888 |
| 2131.1 | 54.108 |
| 2132.1 | 51.012 |
| 2133.1 | 50.184 |
| 2134.1 | 47.916 |
| 2135.1 | 43.992 |
| 2136.1 | 37.908 |
| 2137.1 | 28.584 |
| 2138.1 | 13.896 |
| 2139.1 | 1.512 |
| 2140.1 | 0 |
| 2141.1 | 0 |
| 2142.1 | 0 |
| 2143.1 | 0 |
| 2144.1 | 0 |
| 2145.1 | 0 |
| 2146.1 | 0 |
| 2147.1 | 0 |
| 2148.1 | 0.684 |
| 2149.1 | 1.404 |
| 2150.1 | 3.6 |
| 2151.1 | 4.284 |
| 2152.1 | 10.116 |
| 2153.1 | 16.596 |
| 2154.1 | 19.512 |
| 2155.1 | 19.512 |
| 2156.1 | 19.512 |
| 2157.1 | 19.512 |
| 2158.1 | 20.196 |
| 2159.1 | 22.392 |
| 2160.1 | 23.904 |
| 2161.1 | 25.992 |
| 2162.1 | 26.712 |
| 2163.1 | 28.908 |
| 2164.1 | 28.188 |
| 2165.1 | 28.908 |
| 2166.1 | 31.104 |
| 2167.1 | 33.984 |
| 2168.1 | 36.9 |
| 2169.1 | 42.696 |
| 2170.1 | 46.296 |
| 2171.1 | 47.016 |
| 2172.1 | 47.016 |
| 2173.1 | 47.7 |
| 2174.1 | 47.016 |
| 2175.1 | 46.296 |
| 2176.1 | 44.1 |
| 2177.1 | 44.1 |
| 2178.1 | 44.784 |
| 2179.1 | 45.504 |
| 2180.1 | 47.016 |
| 2181.1 | 47.016 |
| 2182.1 | 48.384 |
| 2183.1 | 49.896 |
| 2184.1 | 50.616 |
| 2185.1 | 49.896 |
| 2186.1 | 48.384 |
| 2187.1 | 47.016 |
| 2188.1 | 46.296 |
| 2189.1 | 45.504 |
| 2190.1 | 44.784 |
| 2191.1 | 45.504 |
| 2192.1 | 47.016 |
| 2193.1 | 51.3 |
| 2194.1 | 54.9 |
| 2195.1 | 59.292 |
| 2196.1 | 64.296 |
| 2197.1 | 65.088 |
| 2198.1 | 65.088 |
| 2199.1 | 65.808 |
| 2200.1 | 65.088 |
| 2201.1 | 64.296 |
| 2202.1 | 65.808 |
| 2203.1 | 68.004 |
| 2204.1 | 72.288 |
| 2205.1 | 72.288 |
| 2206.1 | 72.288 |
| 2207.1 | 71.604 |
| 2208.1 | 70.812 |
| 2209.1 | 70.092 |
| 2210.1 | 69.408 |
| 2211.1 | 67.212 |
| 2212.1 | 65.808 |
| 2213.1 | 66.492 |
| 2214.1 | 66.492 |
| 2215.1 | 67.212 |
| 2216.1 | 65.808 |
| 2217.1 | 64.296 |
| 2218.1 | 63.612 |
| 2219.1 | 62.892 |
| 2220.1 | 62.892 |
| 2221.1 | 63.612 |
| 2222.1 | 64.296 |
| 2223.1 | 65.088 |
| 2224.1 | 66.492 |
| 2225.1 | 66.492 |
| 2226.1 | 68.004 |
| 2227.1 | 68.688 |
| 2228.1 | 68.688 |
| 2229.1 | 68.688 |
| 2230.1 | 67.212 |
| 2231.1 | 65.808 |
| 2232.1 | 63.612 |
| 2233.1 | 61.416 |
| 2234.1 | 57.096 |
| 2235.1 | 54.216 |
| 2236.1 | 53.712 |
| 2237.1 | 53.712 |
| 2238.1 | 52.992 |
| 2239.1 | 54.396 |
| 2240.1 | 55.908 |
| 2241.1 | 59.508 |
| 2242.1 | 64.584 |
| 2243.1 | 69.696 |
| 2244.1 | 73.296 |
| 2245.1 | 76.896 |
| 2246.1 | 74.808 |
| 2247.1 | 74.808 |
| 2248.1 | 74.808 |
| 2249.1 | 74.808 |
| 2250.1 | 74.016 |
| 2251.1 | 74.016 |
| 2252.1 | 73.296 |
| 2253.1 | 71.892 |
| 2254.1 | 70.416 |
| 2255.1 | 69.696 |
| 2256.1 | 69.696 |
| 2257.1 | 71.892 |
| 2258.1 | 73.296 |
| 2259.1 | 74.016 |
| 2260.1 | 73.296 |
| 2261.1 | 73.296 |
| 2262.1 | 75.492 |
| 2263.1 | 76.212 |
| 2264.1 | 75.492 |
| 2265.1 | 73.296 |
| 2266.1 | 71.1 |
| 2267.1 | 69.696 |
| 2268.1 | 66.816 |
| 2269.1 | 65.988 |
| 2270.1 | 65.988 |
| 2271.1 | 67.5 |
| 2272.1 | 69.696 |
| 2273.1 | 69.012 |
| 2274.1 | 66.816 |
| 2275.1 | 65.304 |
| 2276.1 | 63.9 |
| 2277.1 | 61.704 |
| 2278.1 | 51.516 |
| 2279.1 | 38.484 |
| 2280.1 | 34.092 |
| 2281.1 | 35.604 |
| 2282.1 | 37.008 |
| 2283.1 | 39.204 |
| 2284.1 | 39.204 |
| 2285.1 | 39.888 |
| 2286.1 | 42.804 |
| 2287.1 | 42.084 |
| 2288.1 | 41.4 |
| 2289.1 | 40.608 |
| 2290.1 | 41.4 |
| 2291.1 | 42.804 |
| 2292.1 | 44.316 |
| 2293.1 | 46.512 |
| 2294.1 | 44.316 |
| 2295.1 | 43.488 |
| 2296.1 | 44.316 |
| 2297.1 | 44.316 |
| 2298.1 | 45.684 |
| 2299.1 | 50.112 |
| 2300.1 | 52.308 |
| 2301.1 | 51.516 |
| 2302.1 | 50.112 |
| 2303.1 | 49.392 |
| 2304.1 | 50.112 |
| 2305.1 | 50.796 |
| 2306.1 | 48.6 |
| 2307.1 | 47.196 |
| 2308.1 | 47.916 |
| 2309.1 | 50.796 |
| 2310.1 | 53.712 |
| 2311.1 | 53.712 |
| 2312.1 | 53.712 |
| 2313.1 | 55.188 |
| 2314.1 | 55.908 |
| 2315.1 | 55.908 |
| 2316.1 | 55.188 |
| 2317.1 | 54.396 |
| 2318.1 | 55.908 |
| 2319.1 | 56.592 |
| 2320.1 | 57.312 |
| 2321.1 | 56.592 |
| 2322.1 | 59.508 |
| 2323.1 | 61.704 |
| 2324.1 | 63.108 |
| 2325.1 | 62.388 |
| 2326.1 | 61.704 |
| 2327.1 | 61.704 |
| 2328.1 | 62.208 |
| 2329.1 | 62.208 |
| 2330.1 | 63.684 |
| 2331.1 | 63.684 |
| 2332.1 | 64.188 |
| 2333.1 | 65.196 |
| 2334.1 | 65.196 |
| 2335.1 | 65.7 |
| 2336.1 | 66.204 |
| 2337.1 | 66.204 |
| 2338.1 | 66.708 |
| 2339.1 | 66.708 |
| 2340.1 | 66.708 |
| 2341.1 | 66.708 |
| 2342.1 | 66.708 |
| 2343.1 | 66.204 |
| 2344.1 | 65.7 |
| 2345.1 | 66.204 |
| 2346.1 | 65.7 |
| 2347.1 | 65.7 |
| 2348.1 | 65.7 |
| 2349.1 | 65.7 |
| 2350.1 | 65.196 |
| 2351.1 | 65.7 |
| 2352.1 | 65.196 |
| 2353.1 | 66.204 |
| 2354.1 | 67.212 |
| 2355.1 | 70.2 |
| 2356.1 | 73.188 |
| 2357.1 | 75.816 |
| 2358.1 | 78.804 |
| 2359.1 | 80.784 |
| 2360.1 | 82.296 |
| 2361.1 | 83.808 |
| 2362.1 | 83.808 |
| 2363.1 | 83.808 |
| 2364.1 | 83.808 |
| 2365.1 | 83.808 |
| 2366.1 | 83.304 |
| 2367.1 | 83.808 |
| 2368.1 | 83.304 |
| 2369.1 | 82.8 |
| 2370.1 | 81.792 |
| 2371.1 | 80.316 |
| 2372.1 | 79.812 |
| 2373.1 | 78.804 |
| 2374.1 | 76.788 |
| 2375.1 | 75.312 |
| 2376.1 | 73.692 |
| 2377.1 | 71.208 |
| 2378.1 | 68.688 |
| 2379.1 | 67.212 |
| 2380.1 | 66.204 |
| 2381.1 | 67.212 |
| 2382.1 | 68.688 |
| 2383.1 | 69.192 |
| 2384.1 | 70.2 |
| 2385.1 | 70.704 |
| 2386.1 | 71.712 |
| 2387.1 | 72.216 |
| 2388.1 | 71.712 |
| 2389.1 | 72.216 |
| 2390.1 | 72.216 |
| 2391.1 | 71.712 |
| 2392.1 | 72.216 |
| 2393.1 | 72.216 |
| 2394.1 | 72.684 |
| 2395.1 | 72.684 |
| 2396.1 | 71.712 |
| 2397.1 | 70.704 |
| 2398.1 | 69.696 |
| 2399.1 | 68.184 |
| 2400.1 | 67.716 |
| 2401.1 | 67.212 |
| 2402.1 | 67.212 |
| 2403.1 | 66.708 |
| 2404.1 | 66.708 |
| 2405.1 | 66.204 |
| 2406.1 | 66.708 |
| 2407.1 | 66.708 |
| 2408.1 | 67.716 |
| 2409.1 | 67.716 |
| 2410.1 | 68.688 |
| 2411.1 | 69.192 |
| 2412.1 | 69.696 |
| 2413.1 | 69.696 |
| 2414.1 | 70.704 |
| 2415.1 | 70.2 |
| 2416.1 | 68.688 |
| 2417.1 | 67.212 |
| 2418.1 | 67.212 |
| 2419.1 | 66.708 |
| 2420.1 | 66.6 |
| 2421.1 | 66.204 |
| 2422.1 | 65.916 |
| 2423.1 | 65.592 |
| 2424.1 | 65.7 |
| 2425.1 | 65.808 |
| 2426.1 | 65.988 |
| 2427.1 | 66.384 |
| 2428.1 | 66.888 |
| 2429.1 | 66.996 |
| 2430.1 | 67.392 |
| 2431.1 | 67.716 |
| 2432.1 | 67.788 |
| 2433.1 | 67.5 |
| 2434.1 | 67.212 |
| 2435.1 | 66.384 |
| 2436.1 | 65.592 |
| 2437.1 | 65.304 |
| 2438.1 | 65.484 |
| 2439.1 | 65.808 |
| 2440.1 | 66.492 |
| 2441.1 | 66.492 |
| 2442.1 | 66.888 |
| 2443.1 | 67.284 |
| 2444.1 | 67.5 |
| 2445.1 | 68.004 |
| 2446.1 | 68.292 |
| 2447.1 | 68.184 |
| 2448.1 | 68.4 |
| 2449.1 | 68.184 |
| 2450.1 | 68.184 |
| 2451.1 | 68.112 |
| 2452.1 | 67.608 |
| 2453.1 | 67.392 |
| 2454.1 | 67.212 |
| 2455.1 | 67.212 |
| 2456.1 | 67.392 |
| 2457.1 | 67.716 |
| 2458.1 | 67.716 |
| 2459.1 | 67.716 |
| 2460.1 | 67.716 |
| 2461.1 | 67.608 |
| 2462.1 | 67.608 |
| 2463.1 | 67.608 |
| 2464.1 | 67.608 |
| 2465.1 | 67.608 |
| 2466.1 | 67.284 |
| 2467.1 | 66.6 |
| 2468.1 | 66.096 |
| 2469.1 | 65.592 |
| 2470.1 | 65.304 |
| 2471.1 | 64.584 |
| 2472.1 | 63.612 |
| 2473.1 | 62.316 |
| 2474.1 | 61.092 |
| 2475.1 | 60.192 |
| 2476.1 | 59.904 |
| 2477.1 | 59.4 |
| 2478.1 | 57.888 |
| 2479.1 | 55.512 |
| 2480.1 | 50.904 |
| 2481.1 | 45.792 |
| 2482.1 | 38.916 |
| 2483.1 | 32.184 |
| 2484.1 | 28.188 |
| 2485.1 | 26.892 |
| 2486.1 | 28.8 |
| 2487.1 | 32.292 |
| 2488.1 | 36.108 |
| 2489.1 | 38.808 |
| 2490.1 | 39.312 |
| 2491.1 | 42.3 |
| 2492.1 | 46.512 |
| 2493.1 | 50.004 |
| 2494.1 | 52.416 |
| 2495.1 | 53.1 |
| 2496.1 | 52.308 |
| 2497.1 | 50.688 |
| 2498.1 | 50.688 |
| 2499.1 | 51.192 |
| 2500.1 | 51.696 |
| 2501.1 | 50.688 |
| 2502.1 | 50.688 |
| 2503.1 | 51.192 |
| 2504.1 | 51.192 |
| 2505.1 | 51.192 |
| 2506.1 | 51.192 |
| 2507.1 | 51.696 |
| 2508.1 | 51.696 |
| 2509.1 | 51.696 |
| 2510.1 | 52.2 |
| 2511.1 | 52.2 |
| 2512.1 | 52.2 |
| 2513.1 | 51.696 |
| 2514.1 | 52.2 |
| 2515.1 | 52.704 |
| 2516.1 | 51.696 |
| 2517.1 | 51.696 |
| 2518.1 | 51.696 |
| 2519.1 | 51.192 |
| 2520.1 | 50.688 |
| 2521.1 | 51.192 |
| 2522.1 | 51.696 |
| 2523.1 | 50.688 |
| 2524.1 | 49.212 |
| 2525.1 | 47.7 |
| 2526.1 | 46.188 |
| 2527.1 | 45.216 |
| 2528.1 | 45.684 |
| 2529.1 | 46.188 |
| 2530.1 | 45.684 |
| 2531.1 | 46.188 |
| 2532.1 | 46.188 |
| 2533.1 | 46.188 |
| 2534.1 | 46.188 |
| 2535.1 | 44.712 |
| 2536.1 | 39.096 |
| 2537.1 | 33.084 |
| 2538.1 | 30.096 |
| 2539.1 | 29.088 |
| 2540.1 | 30.096 |
| 2541.1 | 33.084 |
| 2542.1 | 35.1 |
| 2543.1 | 37.116 |
| 2544.1 | 39.6 |
| 2545.1 | 41.112 |
| 2546.1 | 43.092 |
| 2547.1 | 45.684 |
| 2548.1 | 46.692 |
| 2549.1 | 47.7 |
| 2550.1 | 47.196 |
| 2551.1 | 47.7 |
| 2552.1 | 47.7 |
| 2553.1 | 47.7 |
| 2554.1 | 47.196 |
| 2555.1 | 45.684 |
| 2556.1 | 45.216 |
| 2557.1 | 43.092 |
| 2558.1 | 43.092 |
| 2559.1 | 41.616 |
| 2560.1 | 40.608 |
| 2561.1 | 40.104 |
| 2562.1 | 38.088 |
| 2563.1 | 36.612 |
| 2564.1 | 35.604 |
| 2565.1 | 34.596 |
| 2566.1 | 34.596 |
| 2567.1 | 34.092 |
| 2568.1 | 33.588 |
| 2569.1 | 32.616 |
| 2570.1 | 30.6 |
| 2571.1 | 25.596 |
| 2572.1 | 19.116 |
| 2573.1 | 12.996 |
| 2574.1 | 9 |
| 2575.1 | 5.508 |
| 2576.1 | 5.508 |
| 2577.1 | 9 |
| 2578.1 | 12.996 |
| 2579.1 | 15.588 |
| 2580.1 | 14.508 |
| 2581.1 | 12.492 |
| 2582.1 | 9 |
| 2583.1 | 7.992 |
| 2584.1 | 7.992 |
| 2585.1 | 9 |
| 2586.1 | 5.004 |
| 2587.1 | 2.016 |
| 2588.1 | 0.504 |
| 2589.1 | 0.504 |
| 2590.1 | 0 |
| 2591.1 | 0 |
| 2592.1 | 0 |
| 2593.1 | 0 |
| 2594.1 | 0 |
| 2595.1 | 1.008 |
| 2596.1 | 7.884 |
| 2597.1 | 13.788 |
| 2598.1 | 17.208 |
| 2599.1 | 20.196 |
| 2600.1 | 22.716 |
| 2601.1 | 26.1 |
| 2602.1 | 29.088 |
| 2603.1 | 32.004 |
| 2604.1 | 35.496 |
| 2605.1 | 37.512 |
| 2606.1 | 37.908 |
| 2607.1 | 37.908 |
| 2608.1 | 38.412 |
| 2609.1 | 39.384 |
| 2610.1 | 40.896 |
| 2611.1 | 42.912 |
| 2612.1 | 44.784 |
| 2613.1 | 46.8 |
| 2614.1 | 48.816 |
| 2615.1 | 49.284 |
| 2616.1 | 50.292 |
| 2617.1 | 50.292 |
| 2618.1 | 49.788 |
| 2619.1 | 51.3 |
| 2620.1 | 52.704 |
| 2621.1 | 52.704 |
| 2622.1 | 54.684 |
| 2623.1 | 56.196 |
| 2624.1 | 56.7 |
| 2625.1 | 56.196 |
| 2626.1 | 55.692 |
| 2627.1 | 54.216 |
| 2628.1 | 54.684 |
| 2629.1 | 55.188 |
| 2630.1 | 55.188 |
| 2631.1 | 55.692 |
| 2632.1 | 55.188 |
| 2633.1 | 54.684 |
| 2634.1 | 54.684 |
| 2635.1 | 53.712 |
| 2636.1 | 52.704 |
| 2637.1 | 52.704 |
| 2638.1 | 53.712 |
| 2639.1 | 53.712 |
| 2640.1 | 54.216 |
| 2641.1 | 55.188 |
| 2642.1 | 56.7 |
| 2643.1 | 57.708 |
| 2644.1 | 57.708 |
| 2645.1 | 58.212 |
| 2646.1 | 59.112 |
| 2647.1 | 60.084 |
| 2648.1 | 61.596 |
| 2649.1 | 62.1 |
| 2650.1 | 63.108 |
| 2651.1 | 65.016 |
| 2652.1 | 65.484 |
| 2653.1 | 65.484 |
| 2654.1 | 66.996 |
| 2655.1 | 68.004 |
| 2656.1 | 68.508 |
| 2657.1 | 68.508 |
| 2658.1 | 66.492 |
| 2659.1 | 65.016 |
| 2660.1 | 63.108 |
| 2661.1 | 61.092 |
| 2662.1 | 60.084 |
| 2663.1 | 58.608 |
| 2664.1 | 57.204 |
| 2665.1 | 56.196 |
| 2666.1 | 56.7 |
| 2667.1 | 57.708 |
| 2668.1 | 57.708 |
| 2669.1 | 58.212 |
| 2670.1 | 59.112 |
| 2671.1 | 59.616 |
| 2672.1 | 59.112 |
| 2673.1 | 59.112 |
| 2674.1 | 57.708 |
| 2675.1 | 56.7 |
| 2676.1 | 56.7 |
| 2677.1 | 56.196 |
| 2678.1 | 55.692 |
| 2679.1 | 54.216 |
| 2680.1 | 54 |
| 2681.1 | 54 |
| 2682.1 | 54 |
| 2683.1 | 54.108 |
| 2684.1 | 53.712 |
| 2685.1 | 54 |
| 2686.1 | 53.784 |
| 2687.1 | 52.884 |
| 2688.1 | 51.984 |
| 2689.1 | 53.712 |
| 2690.1 | 56.7 |
| 2691.1 | 59.616 |
| 2692.1 | 63.612 |
| 2693.1 | 66.312 |
| 2694.1 | 67.716 |
| 2695.1 | 70.596 |
| 2696.1 | 73.512 |
| 2697.1 | 76.212 |
| 2698.1 | 79.092 |
| 2699.1 | 81.396 |
| 2700.1 | 83.988 |
| 2701.1 | 87.084 |
| 2702.1 | 87.912 |
| 2703.1 | 87.3 |
| 2704.1 | 87.084 |
| 2705.1 | 87.588 |
| 2706.1 | 87.516 |
| 2707.1 | 86.904 |
| 2708.1 | 86.688 |
| 2709.1 | 85.5 |
| 2710.1 | 84.312 |
| 2711.1 | 82.908 |
| 2712.1 | 81.288 |
| 2713.1 | 79.596 |
| 2714.1 | 78.192 |
| 2715.1 | 77.184 |
| 2716.1 | 77.4 |
| 2717.1 | 78.012 |
| 2718.1 | 78.696 |
| 2719.1 | 79.812 |
| 2720.1 | 79.2 |
| 2721.1 | 77.4 |
| 2722.1 | 75.384 |
| 2723.1 | 73.404 |
| 2724.1 | 70.812 |
| 2725.1 | 68.616 |
| 2726.1 | 66.204 |
| 2727.1 | 61.488 |
| 2728.1 | 54 |
| 2729.1 | 44.892 |
| 2730.1 | 39.204 |
| 2731.1 | 38.988 |
| 2732.1 | 40.716 |
| 2733.1 | 43.308 |
| 2734.1 | 44.784 |
| 2735.1 | 46.404 |
| 2736.1 | 46.116 |
| 2737.1 | 45.108 |
| 2738.1 | 44.784 |
| 2739.1 | 47.196 |
| 2740.1 | 49.896 |
| 2741.1 | 52.092 |
| 2742.1 | 54.216 |
| 2743.1 | 54.684 |
| 2744.1 | 56.484 |
| 2745.1 | 59.616 |
| 2746.1 | 61.596 |
| 2747.1 | 60.984 |
| 2748.1 | 60.912 |
| 2749.1 | 62.892 |
| 2750.1 | 64.512 |
| 2751.1 | 66.312 |
| 2752.1 | 68.688 |
| 2753.1 | 70.992 |
| 2754.1 | 74.016 |
| 2755.1 | 77.292 |
| 2756.1 | 80.604 |
| 2757.1 | 83.592 |
| 2758.1 | 86.904 |
| 2759.1 | 88.2 |
| 2760.1 | 88.488 |
| 2761.1 | 90.288 |
| 2762.1 | 92.304 |
| 2763.1 | 93.204 |
| 2764.1 | 93.6 |
| 2765.1 | 93.816 |
| 2766.1 | 93.6 |
| 2767.1 | 92.7 |
| 2768.1 | 91.512 |
| 2769.1 | 89.784 |
| 2770.1 | 88.488 |
| 2771.1 | 88.308 |
| 2772.1 | 85.896 |
| 2773.1 | 85.896 |
| 2774.1 | 85.896 |
| 2775.1 | 85.896 |
| 2776.1 | 86.616 |
| 2777.1 | 88.092 |
| 2778.1 | 89.604 |
| 2779.1 | 91.908 |
| 2780.1 | 93.384 |
| 2781.1 | 92.592 |
| 2782.1 | 93.384 |
| 2783.1 | 92.592 |
| 2784.1 | 92.592 |
| 2785.1 | 91.908 |
| 2786.1 | 92.592 |
| 2787.1 | 93.384 |
| 2788.1 | 93.384 |
| 2789.1 | 93.384 |
| 2790.1 | 92.592 |
| 2791.1 | 89.604 |
| 2792.1 | 88.092 |
| 2793.1 | 85.104 |
| 2794.1 | 83.592 |
| 2795.1 | 81.288 |
| 2796.1 | 78.3 |
| 2797.1 | 77.616 |
| 2798.1 | 71.496 |
| 2799.1 | 66.996 |
| 2800.1 | 62.496 |
| 2801.1 | 60.192 |
| 2802.1 | 57.204 |
| 2803.1 | 56.484 |
| 2804.1 | 57.204 |
| 2805.1 | 57.204 |
| 2806.1 | 55.692 |
| 2807.1 | 54.216 |
| 2808.1 | 53.496 |
| 2809.1 | 55.008 |
| 2810.1 | 57.204 |
| 2811.1 | 59.508 |
| 2812.1 | 59.508 |
| 2813.1 | 60.192 |
| 2814.1 | 61.812 |
| 2815.1 | 63.288 |
| 2816.1 | 65.484 |
| 2817.1 | 66.996 |
| 2818.1 | 68.508 |
| 2819.1 | 70.812 |
| 2820.1 | 73.116 |
| 2821.1 | 73.116 |
| 2822.1 | 74.592 |
| 2823.1 | 77.616 |
| 2824.1 | 81.288 |
| 2825.1 | 83.592 |
| 2826.1 | 85.896 |
| 2827.1 | 88.884 |
| 2828.1 | 91.908 |
| 2829.1 | 94.104 |
| 2830.1 | 96.408 |
| 2831.1 | 98.712 |
| 2832.1 | 100.908 |
| 2833.1 | 103.212 |
| 2834.1 | 104.688 |
| 2835.1 | 106.2 |
| 2836.1 | 107.712 |
| 2837.1 | 108.396 |
| 2838.1 | 108.396 |
| 2839.1 | 109.188 |
| 2840.1 | 110.016 |
| 2841.1 | 109.188 |
| 2842.1 | 109.188 |
| 2843.1 | 110.016 |
| 2844.1 | 110.7 |
| 2845.1 | 110.016 |
| 2846.1 | 110.7 |
| 2847.1 | 110.7 |
| 2848.1 | 111.492 |
| 2849.1 | 110.7 |
| 2850.1 | 111.492 |
| 2851.1 | 110.7 |
| 2852.1 | 110.016 |
| 2853.1 | 110.016 |
| 2854.1 | 108.396 |
| 2855.1 | 106.884 |
| 2856.1 | 106.2 |
| 2857.1 | 105.408 |
| 2858.1 | 103.896 |
| 2859.1 | 104.4 |
| 2860.1 | 104.4 |
| 2861.1 | 104.4 |
| 2862.1 | 104.4 |
| 2863.1 | 104.4 |
| 2864.1 | 103.716 |
| 2865.1 | 103.716 |
| 2866.1 | 103.104 |
| 2867.1 | 102.384 |
| 2868.1 | 100.296 |
| 2869.1 | 99.612 |
| 2870.1 | 98.208 |
| 2871.1 | 98.208 |
| 2872.1 | 98.208 |
| 2873.1 | 96.804 |
| 2874.1 | 96.084 |
| 2875.1 | 96.084 |
| 2876.1 | 95.4 |
| 2877.1 | 94.716 |
| 2878.1 | 93.996 |
| 2879.1 | 93.996 |
| 2880.1 | 93.312 |
| 2881.1 | 93.312 |
| 2882.1 | 91.908 |
| 2883.1 | 90.504 |
| 2884.1 | 88.416 |
| 2885.1 | 86.292 |
| 2886.1 | 84.312 |
| 2887.1 | 84.312 |
| 2888.1 | 84.312 |
| 2889.1 | 84.312 |
| 2890.1 | 84.312 |
| 2891.1 | 84.888 |
| 2892.1 | 84.888 |
| 2893.1 | 83.592 |
| 2894.1 | 83.592 |
| 2895.1 | 84.312 |
| 2896.1 | 84.312 |
| 2897.1 | 84.888 |
| 2898.1 | 85.608 |
| 2899.1 | 86.292 |
| 2900.1 | 86.292 |
| 2901.1 | 84.888 |
| 2902.1 | 82.908 |
| 2903.1 | 83.592 |
| 2904.1 | 84.312 |
| 2905.1 | 83.592 |
| 2906.1 | 82.908 |
| 2907.1 | 84.312 |
| 2908.1 | 85.608 |
| 2909.1 | 87.012 |
| 2910.1 | 88.416 |
| 2911.1 | 88.416 |
| 2912.1 | 89.1 |
| 2913.1 | 89.784 |
| 2914.1 | 89.784 |
| 2915.1 | 90.504 |
| 2916.1 | 89.1 |
| 2917.1 | 89.1 |
| 2918.1 | 88.416 |
| 2919.1 | 85.608 |
| 2920.1 | 83.592 |
| 2921.1 | 82.908 |
| 2922.1 | 82.188 |
| 2923.1 | 81.504 |
| 2924.1 | 81.504 |
| 2925.1 | 81.504 |
| 2926.1 | 80.1 |
| 2927.1 | 79.416 |
| 2928.1 | 79.416 |
| 2929.1 | 78.696 |
| 2930.1 | 77.292 |
| 2931.1 | 78.012 |
| 2932.1 | 78.012 |
| 2933.1 | 78.696 |
| 2934.1 | 78.696 |
| 2935.1 | 80.1 |
| 2936.1 | 80.784 |
| 2937.1 | 80.1 |
| 2938.1 | 80.1 |
| 2939.1 | 80.1 |
| 2940.1 | 80.784 |
| 2941.1 | 80.1 |
| 2942.1 | 79.416 |
| 2943.1 | 80.1 |
| 2944.1 | 78.696 |
| 2945.1 | 80.1 |
| 2946.1 | 79.416 |
| 2947.1 | 79.416 |
| 2948.1 | 80.1 |
| 2949.1 | 80.1 |
| 2950.1 | 80.1 |
| 2951.1 | 80.604 |
| 2952.1 | 80.604 |
| 2953.1 | 79.884 |
| 2954.1 | 79.884 |
| 2955.1 | 80.604 |
| 2956.1 | 80.604 |
| 2957.1 | 82.8 |
| 2958.1 | 83.484 |
| 2959.1 | 84.996 |
| 2960.1 | 85.716 |
| 2961.1 | 85.716 |
| 2962.1 | 86.4 |
| 2963.1 | 86.4 |
| 2964.1 | 86.4 |
| 2965.1 | 84.996 |
| 2966.1 | 84.204 |
| 2967.1 | 83.484 |
| 2968.1 | 82.116 |
| 2969.1 | 82.116 |
| 2970.1 | 81.396 |
| 2971.1 | 80.604 |
| 2972.1 | 80.604 |
| 2973.1 | 79.884 |
| 2974.1 | 79.884 |
| 2975.1 | 79.2 |
| 2976.1 | 78.516 |
| 2977.1 | 78.516 |
| 2978.1 | 78.516 |
| 2979.1 | 77.796 |
| 2980.1 | 76.284 |
| 2981.1 | 74.196 |
| 2982.1 | 70.596 |
| 2983.1 | 69.804 |
| 2984.1 | 69.084 |
| 2985.1 | 63.396 |
| 2986.1 | 56.916 |
| 2987.1 | 46.8 |
| 2988.1 | 41.004 |
| 2989.1 | 34.596 |
| 2990.1 | 32.4 |
| 2991.1 | 35.316 |
| 2992.1 | 38.196 |
| 2993.1 | 42.516 |
| 2994.1 | 46.116 |
| 2995.1 | 49.716 |
| 2996.1 | 52.596 |
| 2997.1 | 55.404 |
| 2998.1 | 56.196 |
| 2999.1 | 56.916 |
| 3000.1 | 58.284 |
| 3001.1 | 58.284 |
| 3002.1 | 59.004 |
| 3003.1 | 60.516 |
| 3004.1 | 61.2 |
| 3005.1 | 60.516 |
| 3006.1 | 60.516 |
| 3007.1 | 57.6 |
| 3008.1 | 56.196 |
| 3009.1 | 56.196 |
| 3010.1 | 54.684 |
| 3011.1 | 56.916 |
| 3012.1 | 57.6 |
| 3013.1 | 59.796 |
| 3014.1 | 59.796 |
| 3015.1 | 58.284 |
| 3016.1 | 58.284 |
| 3017.1 | 57.6 |
| 3018.1 | 56.196 |
| 3019.1 | 54 |
| 3020.1 | 48.996 |
| 3021.1 | 45.396 |
| 3022.1 | 43.884 |
| 3023.1 | 42.516 |
| 3024.1 | 39.6 |
| 3025.1 | 39.6 |
| 3026.1 | 40.284 |
| 3027.1 | 40.284 |
| 3028.1 | 40.284 |
| 3029.1 | 41.004 |
| 3030.1 | 45.396 |
| 3031.1 | 47.484 |
| 3032.1 | 50.4 |
| 3033.1 | 51.084 |
| 3034.1 | 52.596 |
| 3035.1 | 54 |
| 3036.1 | 53.316 |
| 3037.1 | 51.804 |
| 3038.1 | 49.716 |
| 3039.1 | 49.716 |
| 3040.1 | 48.204 |
| 3041.1 | 46.116 |
| 3042.1 | 40.284 |
| 3043.1 | 31.716 |
| 3044.1 | 22.284 |
| 3045.1 | 18.684 |
| 3046.1 | 14.4 |
| 3047.1 | 10.8 |
| 3048.1 | 11.484 |
| 3049.1 | 14.4 |
| 3050.1 | 18.684 |
| 3051.1 | 26.604 |
| 3052.1 | 33.084 |
| 3053.1 | 38.196 |
| 3054.1 | 38.916 |
| 3055.1 | 38.196 |
| 3056.1 | 35.316 |
| 3057.1 | 31.716 |
| 3058.1 | 23.004 |
| 3059.1 | 12.996 |
| 3060.1 | 7.884 |
| 3061.1 | 4.284 |
| 3062.1 | 2.916 |
| 3063.1 | 0.684 |
| 3064.1 | 0 |
| 3065.1 | 0 |
| 3066.1 | 0 |
| 3067.1 | 0 |
| 3068.1 | 0 |
| 3099.1 | 0 |
| 3100.1 | 0 |
| 3101.1 | 0 |
| 3102.1 | 0 |
| 3103.1 | 0 |
| 3104.1 | 0 |
| 3105.1 | 2.412 |
| 3106.1 | 2.916 |
| 3107.1 | 5.292 |
| 3108.1 | 11.484 |
| 3109.1 | 16.812 |
| 3110.1 | 19.692 |
| 3111.1 | 21.096 |
| 3112.1 | 24.516 |
| 3113.1 | 26.892 |
| 3114.1 | 28.296 |
| 3115.1 | 28.296 |
| 3116.1 | 27.9 |
| 3117.1 | 27.9 |
| 3118.1 | 29.808 |
| 3119.1 | 31.212 |
| 3120.1 | 32.184 |
| 3121.1 | 32.688 |
| 3122.1 | 33.084 |
| 3123.1 | 36 |
| 3124.1 | 40.284 |
| 3125.1 | 40.788 |
| 3126.1 | 40.284 |
| 3127.1 | 37.908 |
| 3128.1 | 36.504 |
| 3129.1 | 34.092 |
| 3130.1 | 30.708 |
| 3131.1 | 24.516 |
| 3132.1 | 15.804 |
| 3133.1 | 8.604 |
| 3134.1 | 4.284 |
| 3135.1 | 1.404 |
| 3136.1 | 0.504 |
| 3137.1 | 0 |
| 3138.1 | 0 |
| 3139.1 | 0 |
| 3140.1 | 0 |
| 3141.1 | 0 |
| 3142.1 | 0.504 |
| 3143.1 | 5.796 |
| 3144.1 | 12.492 |
| 3145.1 | 18.288 |
| 3146.1 | 21.096 |
| 3147.1 | 24.984 |
| 3148.1 | 29.304 |
| 3149.1 | 35.496 |
| 3150.1 | 40.788 |
| 3151.1 | 44.712 |
| 3152.1 | 45.612 |
| 3153.1 | 46.116 |
| 3154.1 | 47.988 |
| 3155.1 | 47.988 |
| 3156.1 | 47.484 |
| 3157.1 | 49.5 |
| 3158.1 | 50.004 |
| 3159.1 | 51.912 |
| 3160.1 | 53.316 |
| 3161.1 | 54.792 |
| 3162.1 | 57.6 |
| 3163.1 | 56.196 |
| 3164.1 | 55.188 |
| 3165.1 | 53.784 |
| 3166.1 | 52.812 |
| 3167.1 | 50.904 |
| 3168.1 | 48.492 |
| 3169.1 | 42.3 |
| 3170.1 | 36 |
| 3171.1 | 31.716 |
| 3172.1 | 29.808 |
| 3173.1 | 32.184 |
| 3174.1 | 35.496 |
| 3175.1 | 38.916 |
| 3176.1 | 43.2 |
| 3177.1 | 46.116 |
| 3178.1 | 48.996 |
| 3179.1 | 50.4 |
| 3180.1 | 50.4 |
| 3181.1 | 48.996 |
| 3182.1 | 46.584 |
| 3183.1 | 46.116 |
| 3184.1 | 46.116 |
| 3185.1 | 46.8 |
| 3186.1 | 46.8 |
| 3187.1 | 46.116 |
| 3188.1 | 46.116 |
| 3189.1 | 44.604 |
| 3190.1 | 43.884 |
| 3191.1 | 46.116 |
| 3192.1 | 47.484 |
| 3193.1 | 49.716 |
| 3194.1 | 52.596 |
| 3195.1 | 54 |
| 3196.1 | 54 |
| 3197.1 | 51.804 |
| 3198.1 | 47.484 |
| 3199.1 | 44.604 |
| 3200.1 | 41.796 |
| 3201.1 | 39.6 |
| 3202.1 | 38.196 |
| 3203.1 | 36.684 |
| 3204.1 | 38.196 |
| 3205.1 | 38.916 |
| 3206.1 | 40.284 |
| 3207.1 | 41.796 |
| 3208.1 | 40.284 |
| 3209.1 | 40.284 |
| 3210.1 | 43.2 |
| 3211.1 | 46.116 |
| 3212.1 | 50.4 |
| 3213.1 | 54.684 |
| 3214.1 | 59.004 |
| 3215.1 | 62.604 |
| 3216.1 | 66.204 |
| 3217.1 | 69.084 |
| 3218.1 | 73.404 |
| 3219.1 | 77.004 |
| 3220.1 | 79.2 |
| 3221.1 | 79.2 |
| 3222.1 | 80.604 |
| 3223.1 | 79.884 |
| 3224.1 | 79.2 |
| 3225.1 | 77.796 |
| 3226.1 | 77.796 |
| 3227.1 | 77.004 |
| 3228.1 | 78.516 |
| 3229.1 | 79.2 |
| 3230.1 | 81.396 |
| 3231.1 | 82.116 |
| 3232.1 | 83.484 |
| 3233.1 | 84.204 |
| 3234.1 | 84.204 |
| 3235.1 | 81.396 |
| 3236.1 | 79.884 |
| 3237.1 | 78.516 |
| 3238.1 | 77.796 |
| 3239.1 | 79.884 |
| 3240.1 | 81.396 |
| 3241.1 | 83.484 |
| 3242.1 | 86.4 |
| 3243.1 | 87.804 |
| 3244.1 | 90 |
| 3245.1 | 92.196 |
| 3246.1 | 94.284 |
| 3247.1 | 95.796 |
| 3248.1 | 97.884 |
| 3249.1 | 99.396 |
| 3250.1 | 101.484 |
| 3251.1 | 102.996 |
| 3252.1 | 102.996 |
| 3253.1 | 101.484 |
| 3254.1 | 97.2 |
| 3255.1 | 94.284 |
| 3256.1 | 92.916 |
| 3257.1 | 91.404 |
| 3258.1 | 92.196 |
| 3259.1 | 93.6 |
| 3260.1 | 95.004 |
| 3261.1 | 96.516 |
| 3262.1 | 97.884 |
| 3263.1 | 97.884 |
| 3264.1 | 98.604 |
| 3265.1 | 100.8 |
| 3266.1 | 100.8 |
| 3267.1 | 102.204 |
| 3268.1 | 102.204 |
| 3269.1 | 102.996 |
| 3270.1 | 103.716 |
| 3271.1 | 104.796 |
| 3272.1 | 104.796 |
| 3273.1 | 104.796 |
| 3274.1 | 104.796 |
| 3275.1 | 104.796 |
| 3276.1 | 105.804 |
| 3277.1 | 107.208 |
| 3278.1 | 107.712 |
| 3279.1 | 108.684 |
| 3280.1 | 109.188 |
| 3281.1 | 110.196 |
| 3282.1 | 110.196 |
| 3283.1 | 110.7 |
| 3284.1 | 110.196 |
| 3285.1 | 110.196 |
| 3286.1 | 110.196 |
| 3287.1 | 110.196 |
| 3288.1 | 110.7 |
| 3289.1 | 110.7 |
| 3290.1 | 110.7 |
| 3291.1 | 111.204 |
| 3292.1 | 111.204 |
| 3293.1 | 111.204 |
| 3294.1 | 111.708 |
| 3295.1 | 112.212 |
| 3296.1 | 113.184 |
| 3297.1 | 113.184 |
| 3298.1 | 114.192 |
| 3299.1 | 114.192 |
| 3300.1 | 114.696 |
| 3301.1 | 115.092 |
| 3302.1 | 114.696 |
| 3303.1 | 114.696 |
| 3304.1 | 114.696 |
| 3305.1 | 114.192 |
| 3306.1 | 114.192 |
| 3307.1 | 113.688 |
| 3308.1 | 113.688 |
| 3309.1 | 113.184 |
| 3310.1 | 112.716 |
| 3311.1 | 112.716 |
| 3312.1 | 112.212 |
| 3313.1 | 112.716 |
| 3314.1 | 111.708 |
| 3315.1 | 111.708 |
| 3316.1 | 111.708 |
| 3317.1 | 110.7 |
| 3318.1 | 110.196 |
| 3319.1 | 109.692 |
| 3320.1 | 109.188 |
| 3321.1 | 108.684 |
| 3322.1 | 108.216 |
| 3323.1 | 107.712 |
| 3324.1 | 107.208 |
| 3325.1 | 107.208 |
| 3326.1 | 106.704 |
| 3327.1 | 106.704 |
| 3328.1 | 106.704 |
| 3329.1 | 106.308 |
| 3330.1 | 106.308 |
| 3331.1 | 106.308 |
| 3332.1 | 106.308 |
| 3333.1 | 107.712 |
| 3334.1 | 109.188 |
| 3335.1 | 111.708 |
| 3336.1 | 113.184 |
| 3337.1 | 115.596 |
| 3338.1 | 117.612 |
| 3339.1 | 120.096 |
| 3340.1 | 122.112 |
| 3341.1 | 123.516 |
| 3342.1 | 124.488 |
| 3343.1 | 125.496 |
| 3344.1 | 126 |
| 3345.1 | 127.008 |
| 3346.1 | 127.008 |
| 3347.1 | 128.016 |
| 3348.1 | 128.016 |
| 3349.1 | 128.016 |
| 3350.1 | 128.016 |
| 3351.1 | 128.016 |
| 3352.1 | 128.484 |
| 3353.1 | 128.484 |
| 3354.1 | 128.484 |
| 3355.1 | 128.484 |
| 3356.1 | 128.484 |
| 3357.1 | 128.484 |
| 3358.1 | 126 |
| 3359.1 | 123.084 |
| 3360.1 | 121.104 |
| 3361.1 | 120.6 |
| 3362.1 | 120.096 |
| 3363.1 | 119.592 |
| 3364.1 | 119.592 |
| 3365.1 | 119.592 |
| 3366.1 | 119.592 |
| 3367.1 | 119.592 |
| 3368.1 | 119.592 |
| 3369.1 | 120.096 |
| 3370.1 | 119.592 |
| 3371.1 | 120.6 |
| 3372.1 | 120.096 |
| 3373.1 | 120.6 |
| 3374.1 | 120.096 |
| 3375.1 | 119.592 |
| 3376.1 | 120.096 |
| 3377.1 | 121.104 |
| 3378.1 | 122.112 |
| 3379.1 | 123.084 |
| 3380.1 | 124.092 |
| 3381.1 | 125.1 |
| 3382.1 | 126.108 |
| 3383.1 | 127.116 |
| 3384.1 | 128.088 |
| 3385.1 | 128.088 |
| 3386.1 | 129.096 |
| 3387.1 | 130.104 |
| 3388.1 | 130.104 |
| 3389.1 | 130.608 |
| 3390.1 | 131.112 |
| 3391.1 | 131.112 |
| 3392.1 | 131.112 |
| 3393.1 | 131.112 |
| 3394.1 | 130.608 |
| 3395.1 | 130.608 |
| 3396.1 | 130.104 |
| 3397.1 | 130.104 |
| 3398.1 | 129.6 |
| 3399.1 | 129.6 |
| 3400.1 | 129.096 |
| 3401.1 | 128.592 |
| 3402.1 | 129.096 |
| 3403.1 | 128.088 |
| 3404.1 | 128.088 |
| 3405.1 | 127.584 |
| 3406.1 | 127.116 |
| 3407.1 | 127.116 |
| 3408.1 | 126.612 |
| 3409.1 | 126.108 |
| 3410.1 | 125.604 |
| 3411.1 | 125.1 |
| 3412.1 | 125.1 |
| 3413.1 | 124.092 |
| 3414.1 | 123.588 |
| 3415.1 | 123.588 |
| 3416.1 | 123.084 |
| 3417.1 | 122.616 |
| 3418.1 | 123.084 |
| 3419.1 | 123.588 |
| 3420.1 | 123.588 |
| 3421.1 | 124.092 |
| 3422.1 | 124.092 |
| 3423.1 | 124.092 |
| 3424.1 | 124.596 |
| 3425.1 | 124.596 |
| 3426.1 | 124.596 |
| 3427.1 | 125.1 |
| 3428.1 | 124.596 |
| 3429.1 | 125.1 |
| 3430.1 | 124.596 |
| 3431.1 | 125.1 |
| 3432.1 | 125.1 |
| 3433.1 | 125.1 |
| 3434.1 | 124.596 |
| 3435.1 | 123.588 |
| 3436.1 | 123.084 |
| 3437.1 | 121.608 |
| 3438.1 | 120.096 |
| 3439.1 | 120.6 |
| 3440.1 | 120.6 |
| 3441.1 | 121.104 |
| 3442.1 | 121.104 |
| 3443.1 | 121.608 |
| 3444.1 | 121.104 |
| 3445.1 | 121.104 |
| 3446.1 | 121.608 |
| 3447.1 | 122.616 |
| 3448.1 | 122.616 |
| 3449.1 | 123.588 |
| 3450.1 | 124.092 |
| 3451.1 | 124.596 |
| 3452.1 | 125.1 |
| 3453.1 | 125.1 |
| 3454.1 | 125.604 |
| 3455.1 | 125.604 |
| 3456.1 | 125.604 |
| 3457.1 | 126.684 |
| 3458.1 | 126 |
| 3459.1 | 126 |
| 3460.1 | 126.684 |
| 3461.1 | 126 |
| 3462.1 | 127.404 |
| 3463.1 | 126.684 |
| 3464.1 | 126.684 |
| 3465.1 | 127.404 |
| 3466.1 | 126.684 |
| 3467.1 | 127.404 |
| 3468.1 | 126.684 |
| 3469.1 | 126.684 |
| 3470.1 | 127.404 |
| 3471.1 | 126.684 |
| 3472.1 | 126.684 |
| 3473.1 | 126.684 |
| 3474.1 | 126.684 |
| 3475.1 | 126.684 |
| 3476.1 | 126.684 |
| 3477.1 | 126 |
| 3478.1 | 126 |
| 3479.1 | 126.684 |
| 3480.1 | 125.316 |
| 3481.1 | 126 |
| 3482.1 | 125.316 |
| 3483.1 | 126 |
| 3484.1 | 125.316 |
| 3485.1 | 125.316 |
| 3486.1 | 126 |
| 3487.1 | 125.316 |
| 3488.1 | 126 |
| 3489.1 | 126 |
| 3490.1 | 126 |
| 3491.1 | 126.684 |
| 3492.1 | 126 |
| 3493.1 | 126.684 |
| 3494.1 | 126.684 |
| 3495.1 | 126.684 |
| 3496.1 | 127.404 |
| 3497.1 | 127.404 |
| 3498.1 | 128.196 |
| 3499.1 | 128.196 |
| 3500.1 | 128.196 |
| 3501.1 | 128.916 |
| 3502.1 | 128.916 |
| 3503.1 | 128.916 |
| 3504.1 | 128.916 |
| 3505.1 | 128.916 |
| 3506.1 | 128.916 |
| 3507.1 | 128.916 |
| 3508.1 | 128.916 |
| 3509.1 | 129.6 |
| 3510.1 | 129.6 |
| 3511.1 | 128.916 |
| 3512.1 | 129.6 |
| 3513.1 | 129.6 |
| 3514.1 | 129.6 |
| 3515.1 | 129.6 |
| 3516.1 | 129.6 |
| 3517.1 | 129.6 |
| 3518.1 | 129.6 |
| 3519.1 | 129.6 |
| 3520.1 | 129.6 |
| 3521.1 | 130.284 |
| 3522.1 | 130.284 |
| 3523.1 | 130.284 |
| 3524.1 | 130.284 |
| 3525.1 | 131.004 |
| 3526.1 | 131.004 |
| 3527.1 | 131.004 |
| 3528.1 | 131.796 |
| 3529.1 | 131.004 |
| 3530.1 | 131.796 |
| 3531.1 | 131.004 |
| 3532.1 | 131.004 |
| 3533.1 | 129.6 |
| 3534.1 | 128.916 |
| 3535.1 | 127.404 |
| 3536.1 | 127.404 |
| 3537.1 | 126.684 |
| 3538.1 | 126 |
| 3539.1 | 126 |
| 3540.1 | 125.316 |
| 3541.1 | 125.316 |
| 3542.1 | 125.316 |
| 3543.1 | 124.596 |
| 3544.1 | 124.596 |
| 3545.1 | 124.596 |
| 3546.1 | 124.596 |
| 3547.1 | 124.596 |
| 3548.1 | 124.992 |
| 3549.1 | 124.992 |
| 3550.1 | 125.784 |
| 3551.1 | 125.784 |
| 3552.1 | 127.296 |
| 3553.1 | 128.016 |
| 3554.1 | 128.016 |
| 3555.1 | 127.296 |
| 3556.1 | 126.504 |
| 3557.1 | 125.784 |
| 3558.1 | 124.992 |
| 3559.1 | 124.992 |
| 3560.1 | 124.308 |
| 3561.1 | 122.796 |
| 3562.1 | 121.212 |
| 3563.1 | 121.212 |
| 3564.1 | 122.004 |
| 3565.1 | 122.004 |
| 3566.1 | 122.004 |
| 3567.1 | 121.212 |
| 3568.1 | 119.016 |
| 3569.1 | 117.504 |
| 3570.1 | 116.712 |
| 3571.1 | 115.2 |
| 3572.1 | 113.004 |
| 3573.1 | 110.016 |
| 3574.1 | 103.896 |
| 3575.1 | 95.616 |
| 3576.1 | 88.092 |
| 3577.1 | 84.312 |
| 3578.1 | 83.592 |
| 3579.1 | 85.104 |
| 3580.1 | 88.092 |
| 3581.1 | 91.116 |
| 3582.1 | 91.908 |
| 3583.1 | 93.384 |
| 3584.1 | 94.896 |
| 3585.1 | 93.384 |
| 3586.1 | 94.104 |
| 3587.1 | 94.896 |
| 3588.1 | 93.384 |
| 3589.1 | 94.104 |
| 3590.1 | 94.896 |
| 3591.1 | 97.092 |
| 3592.1 | 98.712 |
| 3593.1 | 100.188 |
| 3594.1 | 100.908 |
| 3595.1 | 100.908 |
| 3596.1 | 102.384 |
| 3597.1 | 103.212 |
| 3598.1 | 105.408 |
| 3599.1 | 106.2 |
| 3600.1 | 107.712 |
| 3601.1 | 108.396 |
| 3602.1 | 109.188 |
| 3603.1 | 108.396 |
| 3604.1 | 109.188 |
| 3605.1 | 110.016 |
| 3606.1 | 109.188 |
| 3607.1 | 110.7 |
| 3608.1 | 110.016 |
| 3609.1 | 110.016 |
| 3610.1 | 111.492 |
| 3611.1 | 110.7 |
| 3612.1 | 108.396 |
| 3613.1 | 110.016 |
| 3614.1 | 110.7 |
| 3615.1 | 112.212 |
| 3616.1 | 114.516 |
| 3617.1 | 114.516 |
| 3618.1 | 113.004 |
| 3619.1 | 110.7 |
| 3620.1 | 108.396 |
| 3621.1 | 106.2 |
| 3622.1 | 106.884 |
| 3623.1 | 108.396 |
| 3624.1 | 109.188 |
| 3625.1 | 110.7 |
| 3626.1 | 110.7 |
| 3627.1 | 112.212 |
| 3628.1 | 111.492 |
| 3629.1 | 113.004 |
| 3630.1 | 113.688 |
| 3631.1 | 114.516 |
| 3632.1 | 115.2 |
| 3633.1 | 115.2 |
| 3634.1 | 113.688 |
| 3635.1 | 112.212 |
| 3636.1 | 109.188 |
| 3637.1 | 106.884 |
| 3638.1 | 104.688 |
| 3639.1 | 104.688 |
| 3640.1 | 107.712 |
| 3641.1 | 110.016 |
| 3642.1 | 111.492 |
| 3643.1 | 113.004 |
| 3644.1 | 114.516 |
| 3645.1 | 115.2 |
| 3646.1 | 116.712 |
| 3647.1 | 117.504 |
| 3648.1 | 118.188 |
| 3649.1 | 119.016 |
| 3650.1 | 119.7 |
| 3651.1 | 119.7 |
| 3652.1 | 118.188 |
| 3653.1 | 116.712 |
| 3654.1 | 115.992 |
| 3655.1 | 115.992 |
| 3656.1 | 115.2 |
| 3657.1 | 112.212 |
| 3658.1 | 111.492 |
| 3659.1 | 110.7 |
| 3660.1 | 110.7 |
| 3661.1 | 111.492 |
| 3662.1 | 111.492 |
| 3663.1 | 111.492 |
| 3664.1 | 111.492 |
| 3665.1 | 111.492 |
| 3666.1 | 110.7 |
| 3667.1 | 110.7 |
| 3668.1 | 111.492 |
| 3669.1 | 113.004 |
| 3670.1 | 113.004 |
| 3671.1 | 113.004 |
| 3672.1 | 112.212 |
| 3673.1 | 111.492 |
| 3674.1 | 110.016 |
| 3675.1 | 106.884 |
| 3676.1 | 104.688 |
| 3677.1 | 103.896 |
| 3678.1 | 103.212 |
| 3679.1 | 101.7 |
| 3680.1 | 99.396 |
| 3681.1 | 96.408 |
| 3682.1 | 91.116 |
| 3683.1 | 83.592 |
| 3684.1 | 71.496 |
| 3685.1 | 62.496 |
| 3686.1 | 56.484 |
| 3687.1 | 52.704 |
| 3688.1 | 50.508 |
| 3689.1 | 45.9 |
| 3690.1 | 44.388 |
| 3691.1 | 42.912 |
| 3692.1 | 44.388 |
| 3693.1 | 46.692 |
| 3694.1 | 51.192 |
| 3695.1 | 54.216 |
| 3696.1 | 57.996 |
| 3697.1 | 62.496 |
| 3698.1 | 66.996 |
| 3699.1 | 69.984 |
| 3700.1 | 74.592 |
| 3701.1 | 77.616 |
| 3702.1 | 82.116 |
| 3703.1 | 85.104 |
| 3704.1 | 88.092 |
| 3705.1 | 91.908 |
| 3706.1 | 94.896 |
| 3707.1 | 97.092 |
| 3708.1 | 100.188 |
| 3709.1 | 101.7 |
| 3710.1 | 103.896 |
| 3711.1 | 103.896 |
| 3712.1 | 105.408 |
| 3713.1 | 106.2 |
| 3714.1 | 107.712 |
| 3715.1 | 106.884 |
| 3716.1 | 104.688 |
| 3717.1 | 102.384 |
| 3718.1 | 99.396 |
| 3719.1 | 98.316 |
| 3720.1 | 98.316 |
| 3721.1 | 98.316 |
| 3722.1 | 99.288 |
| 3723.1 | 99.288 |
| 3724.1 | 100.296 |
| 3725.1 | 100.8 |
| 3726.1 | 101.304 |
| 3727.1 | 101.304 |
| 3728.1 | 101.808 |
| 3729.1 | 101.808 |
| 3730.1 | 102.816 |
| 3731.1 | 102.816 |
| 3732.1 | 103.284 |
| 3733.1 | 103.788 |
| 3734.1 | 104.292 |
| 3735.1 | 104.292 |
| 3736.1 | 105.3 |
| 3737.1 | 105.3 |
| 3738.1 | 105.3 |
| 3739.1 | 105.804 |
| 3740.1 | 106.308 |
| 3741.1 | 106.308 |
| 3742.1 | 106.308 |
| 3743.1 | 106.704 |
| 3744.1 | 106.704 |
| 3745.1 | 106.704 |
| 3746.1 | 107.208 |
| 3747.1 | 106.704 |
| 3748.1 | 106.704 |
| 3749.1 | 107.208 |
| 3750.1 | 106.704 |
| 3751.1 | 107.208 |
| 3752.1 | 106.704 |
| 3753.1 | 106.308 |
| 3754.1 | 106.704 |
| 3755.1 | 106.308 |
| 3756.1 | 106.704 |
| 3757.1 | 106.308 |
| 3758.1 | 106.308 |
| 3759.1 | 106.704 |
| 3760.1 | 106.308 |
| 3761.1 | 106.308 |
| 3762.1 | 106.308 |
| 3763.1 | 106.704 |
| 3764.1 | 106.308 |
| 3765.1 | 106.308 |
| 3766.1 | 107.208 |
| 3767.1 | 106.704 |
| 3768.1 | 107.712 |
| 3769.1 | 107.712 |
| 3770.1 | 108.216 |
| 3771.1 | 108.684 |
| 3772.1 | 109.692 |
| 3773.1 | 110.196 |
| 3774.1 | 111.204 |
| 3775.1 | 111.708 |
| 3776.1 | 113.184 |
| 3777.1 | 114.192 |
| 3778.1 | 115.092 |
| 3779.1 | 116.604 |
| 3780.1 | 117.612 |
| 3781.1 | 118.116 |
| 3782.1 | 119.592 |
| 3783.1 | 120.096 |
| 3784.1 | 121.104 |
| 3785.1 | 121.608 |
| 3786.1 | 122.112 |
| 3787.1 | 123.084 |
| 3788.1 | 123.084 |
| 3789.1 | 123.984 |
| 3790.1 | 123.984 |
| 3791.1 | 124.488 |
| 3792.1 | 124.488 |
| 3793.1 | 124.488 |
| 3794.1 | 124.488 |
| 3795.1 | 124.992 |
| 3796.1 | 124.488 |
| 3797.1 | 124.488 |
| 3798.1 | 124.488 |
| 3799.1 | 124.488 |
| 3800.1 | 123.984 |
| 3801.1 | 123.516 |
| 3802.1 | 123.084 |
| 3803.1 | 122.616 |
| 3804.1 | 122.112 |
| 3805.1 | 122.112 |
| 3806.1 | 121.104 |
| 3807.1 | 121.104 |
| 3808.1 | 121.104 |
| 3809.1 | 121.104 |
| 3810.1 | 121.104 |
| 3811.1 | 121.392 |
| 3812.1 | 121.392 |
| 3813.1 | 121.896 |
| 3814.1 | 122.904 |
| 3815.1 | 122.904 |
| 3816.1 | 124.416 |
| 3817.1 | 125.388 |
| 3818.1 | 125.892 |
| 3819.1 | 126.9 |
| 3820.1 | 127.908 |
| 3821.1 | 128.412 |
| 3822.1 | 129.384 |
| 3823.1 | 130.392 |
| 3824.1 | 131.4 |
| 3825.1 | 132.408 |
| 3826.1 | 133.488 |
| 3827.1 | 134.496 |
| 3828.1 | 135.504 |
| 3829.1 | 136.512 |
| 3830.1 | 136.512 |
| 3831.1 | 136.512 |
| 3832.1 | 137.484 |
| 3833.1 | 137.988 |
| 3834.1 | 137.988 |
| 3835.1 | 138.492 |
| 3836.1 | 140.004 |
| 3837.1 | 140.508 |
| 3838.1 | 141.516 |
| 3839.1 | 142.992 |
| 3840.1 | 143.496 |
| 3841.1 | 145.008 |
| 3842.1 | 145.512 |
| 3843.1 | 146.484 |
| 3844.1 | 147.492 |
| 3845.1 | 146.988 |
| 3846.1 | 147.996 |
| 3847.1 | 147.996 |
| 3848.1 | 147.492 |
| 3849.1 | 147.492 |
| 3850.1 | 146.988 |
| 3851.1 | 146.016 |
| 3852.1 | 146.016 |
| 3853.1 | 145.008 |
| 3854.1 | 144.504 |
| 3855.1 | 144.504 |
| 3856.1 | 143.496 |
| 3857.1 | 143.496 |
| 3858.1 | 142.992 |
| 3859.1 | 142.992 |
| 3860.1 | 142.488 |
| 3861.1 | 141.984 |
| 3862.1 | 141.984 |
| 3863.1 | 141.984 |
| 3864.1 | 141.516 |
| 3865.1 | 141.012 |
| 3866.1 | 141.012 |
| 3867.1 | 140.508 |
| 3868.1 | 140.508 |
| 3869.1 | 140.508 |
| 3870.1 | 140.508 |
| 3871.1 | 140.004 |
| 3872.1 | 140.004 |
| 3873.1 | 140.508 |
| 3874.1 | 140.004 |
| 3875.1 | 140.004 |
| 3876.1 | 140.004 |
| 3877.1 | 140.508 |
| 3878.1 | 140.508 |
| 3879.1 | 140.508 |
| 3880.1 | 140.508 |
| 3881.1 | 141.012 |
| 3882.1 | 141.012 |
| 3883.1 | 141.012 |
| 3884.1 | 140.508 |
| 3885.1 | 141.516 |
| 3886.1 | 141.012 |
| 3887.1 | 141.012 |
| 3888.1 | 141.012 |
| 3889.1 | 141.516 |
| 3890.1 | 141.012 |
| 3891.1 | 141.516 |
| 3892.1 | 141.516 |
| 3893.1 | 141.012 |
| 3894.1 | 141.516 |
| 3895.1 | 141.012 |
| 3896.1 | 141.516 |
| 3897.1 | 141.012 |
| 3898.1 | 141.012 |
| 3899.1 | 140.508 |
| 3900.1 | 140.508 |
| 3901.1 | 140.508 |
| 3902.1 | 140.508 |
| 3903.1 | 140.508 |
| 3904.1 | 140.688 |
| 3905.1 | 140.688 |
| 3906.1 | 141.3 |
| 3907.1 | 141.3 |
| 3908.1 | 141.3 |
| 3909.1 | 141.984 |
| 3910.1 | 142.704 |
| 3911.1 | 141.984 |
| 3912.1 | 142.704 |
| 3913.1 | 143.388 |
| 3914.1 | 143.388 |
| 3915.1 | 143.388 |
| 3916.1 | 144.108 |
| 3917.1 | 144.792 |
| 3918.1 | 144.108 |
| 3919.1 | 144.108 |
| 3920.1 | 144.792 |
| 3921.1 | 143.388 |
| 3922.1 | 143.388 |
| 3923.1 | 142.704 |
| 3924.1 | 142.704 |
| 3925.1 | 142.704 |
| 3926.1 | 142.704 |
| 3927.1 | 141.3 |
| 3928.1 | 138.6 |
| 3929.1 | 137.196 |
| 3930.1 | 137.196 |
| 3931.1 | 134.388 |
| 3932.1 | 133.704 |
| 3933.1 | 132.984 |
| 3934.1 | 132.984 |
| 3935.1 | 134.388 |
| 3936.1 | 134.388 |
| 3937.1 | 135.792 |
| 3938.1 | 137.196 |
| 3939.1 | 138.6 |
| 3940.1 | 140.688 |
| 3941.1 | 142.704 |
| 3942.1 | 144.792 |
| 3943.1 | 146.196 |
| 3944.1 | 147.6 |
| 3945.1 | 149.004 |
| 3946.1 | 150.408 |
| 3947.1 | 150.408 |
| 3948.1 | 150.408 |
| 3949.1 | 149.688 |
| 3950.1 | 148.284 |
| 3951.1 | 146.916 |
| 3952.1 | 146.916 |
| 3953.1 | 146.196 |
| 3954.1 | 144.792 |
| 3955.1 | 144.792 |
| 3956.1 | 143.388 |
| 3957.1 | 143.388 |
| 3958.1 | 142.704 |
| 3959.1 | 143.388 |
| 3960.1 | 142.704 |
| 3961.1 | 142.704 |
| 3962.1 | 143.388 |
| 3963.1 | 143.388 |
| 3964.1 | 142.704 |
| 3965.1 | 142.704 |
| 3966.1 | 142.704 |
| 3967.1 | 139.284 |
| 3968.1 | 137.196 |
| 3969.1 | 135.108 |
| 3970.1 | 135.108 |
| 3971.1 | 135.108 |
| 3972.1 | 133.704 |
| 3973.1 | 130.896 |
| 3974.1 | 128.088 |
| 3975.1 | 126.684 |
| 3976.1 | 124.596 |
| 3977.1 | 123.192 |
| 3978.1 | 121.212 |
| 3979.1 | 119.808 |
| 3980.1 | 118.404 |
| 3981.1 | 117 |
| 3982.1 | 117 |
| 3983.1 | 117.684 |
| 3984.1 | 118.404 |
| 3985.1 | 119.808 |
| 3986.1 | 120.492 |
| 3987.1 | 121.896 |
| 3988.1 | 122.508 |
| 3989.1 | 123.192 |
| 3990.1 | 123.912 |
| 3991.1 | 123.912 |
| 3992.1 | 123.912 |
| 3993.1 | 123.912 |
| 3994.1 | 124.884 |
| 3995.1 | 122.508 |
| 3996.1 | 122.004 |
| 3997.1 | 122.004 |
| 3998.1 | 120.096 |
| 3999.1 | 118.584 |
| 4000.1 | 116.712 |
| 4001.1 | 114.3 |
| 4002.1 | 112.392 |
| 4003.1 | 110.016 |
| 4004.1 | 108.504 |
| 4005.1 | 105.696 |
| 4006.1 | 104.796 |
| 4007.1 | 104.796 |
| 4008.1 | 104.796 |
| 4009.1 | 104.796 |
| 4010.1 | 104.796 |
| 4011.1 | 104.796 |
| 4012.1 | 99.9 |
| 4013.1 | 93.708 |
| 4014.1 | 87.912 |
| 4015.1 | 86.004 |
| 4016.1 | 83.592 |
| 4017.1 | 82.116 |
| 4018.1 | 82.116 |
| 4019.1 | 81.684 |
| 4020.1 | 82.116 |
| 4021.1 | 82.116 |
| 4022.1 | 82.116 |
| 4023.1 | 81.684 |
| 4024.1 | 83.088 |
| 4025.1 | 81.684 |
| 4026.1 | 78.804 |
| 4027.1 | 77.796 |
| 4028.1 | 74.412 |
| 4029.1 | 74.016 |
| 4030.1 | 73.512 |
| 4031.1 | 73.008 |
| 4032.1 | 72.504 |
| 4033.1 | 67.716 |
| 4034.1 | 59.616 |
| 4035.1 | 54.792 |
| 4036.1 | 53.316 |
| 4037.1 | 52.812 |
| 4038.1 | 55.692 |
| 4039.1 | 59.112 |
| 4040.1 | 60.516 |
| 4041.1 | 63.9 |
| 4042.1 | 67.716 |
| 4043.1 | 71.1 |
| 4044.1 | 74.916 |
| 4045.1 | 77.292 |
| 4046.1 | 76.392 |
| 4047.1 | 78.804 |
| 4048.1 | 79.704 |
| 4049.1 | 80.208 |
| 4050.1 | 80.712 |
| 4051.1 | 80.712 |
| 4052.1 | 80.712 |
| 4053.1 | 81.216 |
| 4054.1 | 82.116 |
| 4055.1 | 84.096 |
| 4056.1 | 86.004 |
| 4057.1 | 87.912 |
| 4058.1 | 89.784 |
| 4059.1 | 89.316 |
| 4060.1 | 89.316 |
| 4061.1 | 89.784 |
| 4062.1 | 91.296 |
| 4063.1 | 93.204 |
| 4064.1 | 94.608 |
| 4065.1 | 96.084 |
| 4066.1 | 95.112 |
| 4067.1 | 93.204 |
| 4068.1 | 90.792 |
| 4069.1 | 87.912 |
| 4070.1 | 86.004 |
| 4071.1 | 84.096 |
| 4072.1 | 82.116 |
| 4073.1 | 81.216 |
| 4074.1 | 81.216 |
| 4075.1 | 80.388 |
| 4076.1 | 79.704 |
| 4077.1 | 77.4 |
| 4078.1 | 76.608 |
| 4079.1 | 75.096 |
| 4080.1 | 72.792 |
| 4081.1 | 69.696 |
| 4082.1 | 65.088 |
| 4083.1 | 58.212 |
| 4084.1 | 46.692 |
| 4085.1 | 39.816 |
| 4086.1 | 41.4 |
| 4087.1 | 43.704 |
| 4088.1 | 46.692 |
| 4089.1 | 50.616 |
| 4090.1 | 53.604 |
| 4091.1 | 56.7 |
| 4092.1 | 58.212 |
| 4093.1 | 59.004 |
| 4094.1 | 59.004 |
| 4095.1 | 56.7 |
| 4096.1 | 53.604 |
| 4097.1 | 50.616 |
| 4098.1 | 48.312 |
| 4099.1 | 45.216 |
| 4100.1 | 42.912 |
| 4101.1 | 38.304 |
| 4102.1 | 31.392 |
| 4103.1 | 23.688 |
| 4104.1 | 21.384 |
| 4105.1 | 21.384 |
| 4106.1 | 20.7 |
| 4107.1 | 16.884 |
| 4108.1 | 10.008 |
| 4109.1 | 10.008 |
| 4110.1 | 16.884 |
| 4111.1 | 21.384 |
| 4112.1 | 23.688 |
| 4113.1 | 29.088 |
| 4114.1 | 33.696 |
| 4115.1 | 38.304 |
| 4116.1 | 40.608 |
| 4117.1 | 39.816 |
| 4118.1 | 41.4 |
| 4119.1 | 42.912 |
| 4120.1 | 42.912 |
| 4121.1 | 43.704 |
| 4122.1 | 43.704 |
| 4123.1 | 43.704 |
| 4124.1 | 42.084 |
| 4125.1 | 39.816 |
| 4126.1 | 38.304 |
| 4127.1 | 36 |
| 4128.1 | 34.488 |
| 4129.1 | 34.488 |
| 4130.1 | 36 |
| 4131.1 | 39.096 |
| 4132.1 | 40.608 |
| 4133.1 | 43.704 |
| 4134.1 | 45.216 |
| 4135.1 | 46.008 |
| 4136.1 | 47.484 |
| 4137.1 | 48.312 |
| 4138.1 | 46.692 |
| 4139.1 | 45.216 |
| 4140.1 | 43.704 |
| 4141.1 | 42.912 |
| 4142.1 | 39.816 |
| 4143.1 | 30.6 |
| 4144.1 | 23.004 |
| 4145.1 | 21.384 |
| 4146.1 | 20.7 |
| 4147.1 | 19.908 |
| 4148.1 | 25.308 |
| 4149.1 | 32.184 |
| 4150.1 | 35.208 |
| 4151.1 | 34.488 |
| 4152.1 | 33.696 |
| 4153.1 | 32.184 |
| 4154.1 | 28.296 |
| 4155.1 | 23.688 |
| 4156.1 | 16.884 |
| 4157.1 | 12.996 |
| 4158.1 | 12.312 |
| 4159.1 | 10.008 |
| 4160.1 | 6.912 |
| 4161.1 | 0.792 |
| 4162.1 | 0 |
| 4163.1 | 0 |
| 4164.1 | 0 |
| 4165.1 | 0 |
| 4166.1 | 0 |